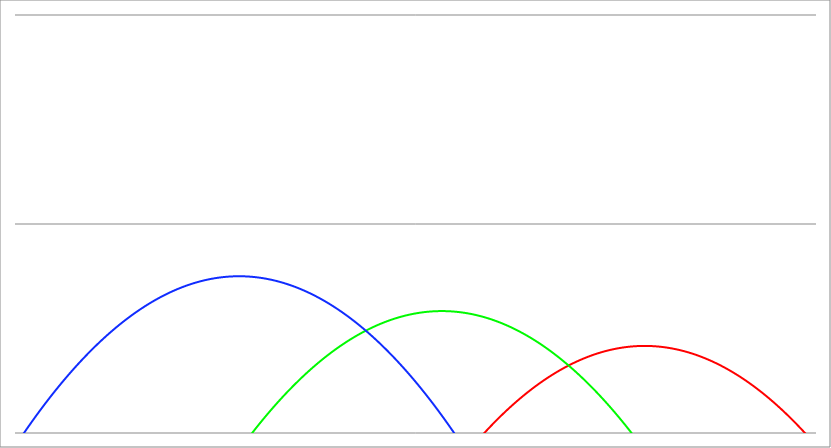
| Category | Series 1 | Series 0 | Series 2 |
|---|---|---|---|
| -4.2 | -41.94 | -20.14 | -6.34 |
| -4.19605 | -41.891 | -20.107 | -6.323 |
| -4.192100000000001 | -41.842 | -20.074 | -6.305 |
| -4.188150000000001 | -41.793 | -20.041 | -6.288 |
| -4.184200000000001 | -41.744 | -20.008 | -6.271 |
| -4.180250000000002 | -41.695 | -19.974 | -6.253 |
| -4.176300000000002 | -41.647 | -19.941 | -6.236 |
| -4.172350000000002 | -41.598 | -19.909 | -6.219 |
| -4.168400000000003 | -41.549 | -19.876 | -6.202 |
| -4.164450000000003 | -41.5 | -19.843 | -6.185 |
| -4.160500000000003 | -41.452 | -19.81 | -6.168 |
| -4.156550000000004 | -41.403 | -19.777 | -6.151 |
| -4.152600000000004 | -41.354 | -19.744 | -6.134 |
| -4.148650000000004 | -41.306 | -19.711 | -6.117 |
| -4.144700000000005 | -41.257 | -19.679 | -6.1 |
| -4.140750000000005 | -41.209 | -19.646 | -6.083 |
| -4.136800000000005 | -41.16 | -19.613 | -6.066 |
| -4.132850000000006 | -41.112 | -19.58 | -6.049 |
| -4.128900000000006 | -41.063 | -19.548 | -6.032 |
| -4.124950000000006 | -41.015 | -19.515 | -6.015 |
| -4.121000000000007 | -40.967 | -19.483 | -5.999 |
| -4.117050000000007 | -40.918 | -19.45 | -5.982 |
| -4.113100000000007 | -40.87 | -19.418 | -5.965 |
| -4.109150000000008 | -40.822 | -19.385 | -5.949 |
| -4.105200000000008 | -40.773 | -19.353 | -5.932 |
| -4.101250000000008 | -40.725 | -19.32 | -5.915 |
| -4.097300000000009 | -40.677 | -19.288 | -5.899 |
| -4.093350000000009 | -40.629 | -19.256 | -5.882 |
| -4.08940000000001 | -40.581 | -19.223 | -5.866 |
| -4.08545000000001 | -40.533 | -19.191 | -5.849 |
| -4.08150000000001 | -40.485 | -19.159 | -5.833 |
| -4.07755000000001 | -40.437 | -19.126 | -5.816 |
| -4.07360000000001 | -40.389 | -19.094 | -5.8 |
| -4.069650000000011 | -40.341 | -19.062 | -5.783 |
| -4.065700000000011 | -40.293 | -19.03 | -5.767 |
| -4.061750000000012 | -40.245 | -18.998 | -5.751 |
| -4.057800000000012 | -40.197 | -18.966 | -5.735 |
| -4.053850000000012 | -40.149 | -18.934 | -5.718 |
| -4.049900000000012 | -40.101 | -18.902 | -5.702 |
| -4.045950000000013 | -40.054 | -18.87 | -5.686 |
| -4.042000000000013 | -40.006 | -18.838 | -5.67 |
| -4.038050000000013 | -39.958 | -18.806 | -5.654 |
| -4.034100000000014 | -39.91 | -18.774 | -5.638 |
| -4.030150000000014 | -39.863 | -18.742 | -5.622 |
| -4.026200000000014 | -39.815 | -18.71 | -5.605 |
| -4.022250000000015 | -39.767 | -18.678 | -5.589 |
| -4.018300000000015 | -39.72 | -18.647 | -5.574 |
| -4.014350000000015 | -39.672 | -18.615 | -5.558 |
| -4.010400000000016 | -39.625 | -18.583 | -5.542 |
| -4.006450000000016 | -39.577 | -18.552 | -5.526 |
| -4.002500000000016 | -39.53 | -18.52 | -5.51 |
| -3.998550000000016 | -39.483 | -18.488 | -5.494 |
| -3.994600000000016 | -39.435 | -18.457 | -5.478 |
| -3.990650000000016 | -39.388 | -18.425 | -5.463 |
| -3.986700000000016 | -39.341 | -18.394 | -5.447 |
| -3.982750000000016 | -39.293 | -18.362 | -5.431 |
| -3.978800000000016 | -39.246 | -18.331 | -5.416 |
| -3.974850000000016 | -39.199 | -18.299 | -5.4 |
| -3.970900000000015 | -39.152 | -18.268 | -5.384 |
| -3.966950000000015 | -39.104 | -18.237 | -5.369 |
| -3.963000000000015 | -39.057 | -18.205 | -5.353 |
| -3.959050000000015 | -39.01 | -18.174 | -5.338 |
| -3.955100000000015 | -38.963 | -18.143 | -5.322 |
| -3.951150000000015 | -38.916 | -18.112 | -5.307 |
| -3.947200000000015 | -38.869 | -18.08 | -5.292 |
| -3.943250000000015 | -38.822 | -18.049 | -5.276 |
| -3.939300000000014 | -38.775 | -18.018 | -5.261 |
| -3.935350000000014 | -38.728 | -17.987 | -5.246 |
| -3.931400000000014 | -38.682 | -17.956 | -5.23 |
| -3.927450000000014 | -38.635 | -17.925 | -5.215 |
| -3.923500000000014 | -38.588 | -17.894 | -5.2 |
| -3.919550000000014 | -38.541 | -17.863 | -5.185 |
| -3.915600000000014 | -38.494 | -17.832 | -5.17 |
| -3.911650000000014 | -38.448 | -17.801 | -5.154 |
| -3.907700000000013 | -38.401 | -17.77 | -5.139 |
| -3.903750000000013 | -38.354 | -17.739 | -5.124 |
| -3.899800000000013 | -38.308 | -17.708 | -5.109 |
| -3.895850000000013 | -38.261 | -17.678 | -5.094 |
| -3.891900000000013 | -38.214 | -17.647 | -5.079 |
| -3.887950000000013 | -38.168 | -17.616 | -5.064 |
| -3.884000000000013 | -38.121 | -17.585 | -5.049 |
| -3.880050000000013 | -38.075 | -17.555 | -5.035 |
| -3.876100000000012 | -38.029 | -17.524 | -5.02 |
| -3.872150000000012 | -37.982 | -17.494 | -5.005 |
| -3.868200000000012 | -37.936 | -17.463 | -4.99 |
| -3.864250000000012 | -37.889 | -17.432 | -4.975 |
| -3.860300000000012 | -37.843 | -17.402 | -4.961 |
| -3.856350000000012 | -37.797 | -17.371 | -4.946 |
| -3.852400000000012 | -37.751 | -17.341 | -4.931 |
| -3.848450000000012 | -37.704 | -17.311 | -4.917 |
| -3.844500000000012 | -37.658 | -17.28 | -4.902 |
| -3.840550000000011 | -37.612 | -17.25 | -4.888 |
| -3.836600000000011 | -37.566 | -17.219 | -4.873 |
| -3.832650000000011 | -37.52 | -17.189 | -4.859 |
| -3.828700000000011 | -37.474 | -17.159 | -4.844 |
| -3.824750000000011 | -37.428 | -17.129 | -4.83 |
| -3.820800000000011 | -37.382 | -17.099 | -4.815 |
| -3.816850000000011 | -37.336 | -17.068 | -4.801 |
| -3.812900000000011 | -37.29 | -17.038 | -4.787 |
| -3.80895000000001 | -37.244 | -17.008 | -4.772 |
| -3.80500000000001 | -37.198 | -16.978 | -4.758 |
| -3.80105000000001 | -37.152 | -16.948 | -4.744 |
| -3.79710000000001 | -37.106 | -16.918 | -4.73 |
| -3.79315000000001 | -37.061 | -16.888 | -4.715 |
| -3.78920000000001 | -37.015 | -16.858 | -4.701 |
| -3.78525000000001 | -36.969 | -16.828 | -4.687 |
| -3.78130000000001 | -36.923 | -16.798 | -4.673 |
| -3.777350000000009 | -36.878 | -16.768 | -4.659 |
| -3.773400000000009 | -36.832 | -16.739 | -4.645 |
| -3.769450000000009 | -36.787 | -16.709 | -4.631 |
| -3.76550000000001 | -36.741 | -16.679 | -4.617 |
| -3.761550000000009 | -36.695 | -16.649 | -4.603 |
| -3.757600000000009 | -36.65 | -16.62 | -4.589 |
| -3.753650000000009 | -36.604 | -16.59 | -4.575 |
| -3.749700000000009 | -36.559 | -16.56 | -4.561 |
| -3.745750000000008 | -36.514 | -16.531 | -4.548 |
| -3.741800000000008 | -36.468 | -16.501 | -4.534 |
| -3.737850000000008 | -36.423 | -16.472 | -4.52 |
| -3.733900000000008 | -36.378 | -16.442 | -4.506 |
| -3.729950000000008 | -36.332 | -16.413 | -4.493 |
| -3.726000000000008 | -36.287 | -16.383 | -4.479 |
| -3.722050000000008 | -36.242 | -16.354 | -4.465 |
| -3.718100000000008 | -36.197 | -16.324 | -4.452 |
| -3.714150000000008 | -36.152 | -16.295 | -4.438 |
| -3.710200000000007 | -36.106 | -16.266 | -4.425 |
| -3.706250000000007 | -36.061 | -16.236 | -4.411 |
| -3.702300000000007 | -36.016 | -16.207 | -4.398 |
| -3.698350000000007 | -35.971 | -16.178 | -4.384 |
| -3.694400000000007 | -35.926 | -16.149 | -4.371 |
| -3.690450000000007 | -35.881 | -16.119 | -4.358 |
| -3.686500000000007 | -35.836 | -16.09 | -4.344 |
| -3.682550000000007 | -35.791 | -16.061 | -4.331 |
| -3.678600000000006 | -35.746 | -16.032 | -4.318 |
| -3.674650000000006 | -35.702 | -16.003 | -4.304 |
| -3.670700000000006 | -35.657 | -15.974 | -4.291 |
| -3.666750000000006 | -35.612 | -15.945 | -4.278 |
| -3.662800000000006 | -35.567 | -15.916 | -4.265 |
| -3.658850000000006 | -35.523 | -15.887 | -4.252 |
| -3.654900000000006 | -35.478 | -15.858 | -4.239 |
| -3.650950000000006 | -35.433 | -15.829 | -4.226 |
| -3.647000000000005 | -35.389 | -15.801 | -4.213 |
| -3.643050000000005 | -35.344 | -15.772 | -4.2 |
| -3.639100000000005 | -35.299 | -15.743 | -4.187 |
| -3.635150000000005 | -35.255 | -15.714 | -4.174 |
| -3.631200000000005 | -35.21 | -15.686 | -4.161 |
| -3.627250000000005 | -35.166 | -15.657 | -4.148 |
| -3.623300000000005 | -35.122 | -15.628 | -4.135 |
| -3.619350000000005 | -35.077 | -15.6 | -4.122 |
| -3.615400000000005 | -35.033 | -15.571 | -4.11 |
| -3.611450000000004 | -34.988 | -15.543 | -4.097 |
| -3.607500000000004 | -34.944 | -15.514 | -4.084 |
| -3.603550000000004 | -34.9 | -15.486 | -4.071 |
| -3.599600000000004 | -34.856 | -15.457 | -4.059 |
| -3.595650000000004 | -34.811 | -15.429 | -4.046 |
| -3.591700000000004 | -34.767 | -15.4 | -4.034 |
| -3.587750000000004 | -34.723 | -15.372 | -4.021 |
| -3.583800000000004 | -34.679 | -15.344 | -4.008 |
| -3.579850000000004 | -34.635 | -15.315 | -3.996 |
| -3.575900000000003 | -34.591 | -15.287 | -3.983 |
| -3.571950000000003 | -34.547 | -15.259 | -3.971 |
| -3.568000000000003 | -34.503 | -15.231 | -3.959 |
| -3.564050000000003 | -34.459 | -15.202 | -3.946 |
| -3.560100000000003 | -34.415 | -15.174 | -3.934 |
| -3.556150000000003 | -34.371 | -15.146 | -3.922 |
| -3.552200000000003 | -34.327 | -15.118 | -3.909 |
| -3.548250000000003 | -34.283 | -15.09 | -3.897 |
| -3.544300000000002 | -34.239 | -15.062 | -3.885 |
| -3.540350000000002 | -34.195 | -15.034 | -3.873 |
| -3.536400000000002 | -34.152 | -15.006 | -3.861 |
| -3.532450000000002 | -34.108 | -14.978 | -3.848 |
| -3.528500000000002 | -34.064 | -14.95 | -3.836 |
| -3.524550000000002 | -34.021 | -14.922 | -3.824 |
| -3.520600000000002 | -33.977 | -14.895 | -3.812 |
| -3.516650000000002 | -33.933 | -14.867 | -3.8 |
| -3.512700000000001 | -33.89 | -14.839 | -3.788 |
| -3.508750000000001 | -33.846 | -14.811 | -3.776 |
| -3.504800000000001 | -33.803 | -14.784 | -3.764 |
| -3.500850000000001 | -33.759 | -14.756 | -3.753 |
| -3.496900000000001 | -33.716 | -14.728 | -3.741 |
| -3.492950000000001 | -33.672 | -14.701 | -3.729 |
| -3.489000000000001 | -33.629 | -14.673 | -3.717 |
| -3.485050000000001 | -33.586 | -14.646 | -3.705 |
| -3.4811 | -33.542 | -14.618 | -3.694 |
| -3.47715 | -33.499 | -14.591 | -3.682 |
| -3.4732 | -33.456 | -14.563 | -3.67 |
| -3.46925 | -33.413 | -14.536 | -3.659 |
| -3.4653 | -33.37 | -14.508 | -3.647 |
| -3.46135 | -33.326 | -14.481 | -3.636 |
| -3.4574 | -33.283 | -14.454 | -3.624 |
| -3.45345 | -33.24 | -14.426 | -3.613 |
| -3.4495 | -33.197 | -14.399 | -3.601 |
| -3.445549999999999 | -33.154 | -14.372 | -3.59 |
| -3.441599999999999 | -33.111 | -14.345 | -3.578 |
| -3.437649999999999 | -33.068 | -14.317 | -3.567 |
| -3.433699999999999 | -33.025 | -14.29 | -3.555 |
| -3.429749999999999 | -32.982 | -14.263 | -3.544 |
| -3.425799999999999 | -32.939 | -14.236 | -3.533 |
| -3.421849999999999 | -32.896 | -14.209 | -3.522 |
| -3.417899999999999 | -32.854 | -14.182 | -3.51 |
| -3.413949999999998 | -32.811 | -14.155 | -3.499 |
| -3.409999999999998 | -32.768 | -14.128 | -3.488 |
| -3.406049999999998 | -32.725 | -14.101 | -3.477 |
| -3.402099999999998 | -32.683 | -14.074 | -3.466 |
| -3.398149999999998 | -32.64 | -14.047 | -3.455 |
| -3.394199999999998 | -32.597 | -14.021 | -3.444 |
| -3.390249999999998 | -32.555 | -13.994 | -3.433 |
| -3.386299999999998 | -32.512 | -13.967 | -3.422 |
| -3.382349999999997 | -32.47 | -13.94 | -3.411 |
| -3.378399999999997 | -32.427 | -13.914 | -3.4 |
| -3.374449999999997 | -32.385 | -13.887 | -3.389 |
| -3.370499999999997 | -32.342 | -13.86 | -3.378 |
| -3.366549999999997 | -32.3 | -13.834 | -3.367 |
| -3.362599999999997 | -32.257 | -13.807 | -3.357 |
| -3.358649999999997 | -32.215 | -13.781 | -3.346 |
| -3.354699999999997 | -32.173 | -13.754 | -3.335 |
| -3.350749999999997 | -32.131 | -13.728 | -3.325 |
| -3.346799999999996 | -32.088 | -13.701 | -3.314 |
| -3.342849999999996 | -32.046 | -13.675 | -3.303 |
| -3.338899999999996 | -32.004 | -13.648 | -3.293 |
| -3.334949999999996 | -31.962 | -13.622 | -3.282 |
| -3.330999999999996 | -31.92 | -13.596 | -3.272 |
| -3.327049999999996 | -31.877 | -13.569 | -3.261 |
| -3.323099999999996 | -31.835 | -13.543 | -3.251 |
| -3.319149999999996 | -31.793 | -13.517 | -3.24 |
| -3.315199999999995 | -31.751 | -13.491 | -3.23 |
| -3.311249999999995 | -31.709 | -13.464 | -3.219 |
| -3.307299999999995 | -31.667 | -13.438 | -3.209 |
| -3.303349999999995 | -31.626 | -13.412 | -3.199 |
| -3.299399999999995 | -31.584 | -13.386 | -3.188 |
| -3.295449999999995 | -31.542 | -13.36 | -3.178 |
| -3.291499999999995 | -31.5 | -13.334 | -3.168 |
| -3.287549999999995 | -31.458 | -13.308 | -3.158 |
| -3.283599999999994 | -31.416 | -13.282 | -3.148 |
| -3.279649999999994 | -31.375 | -13.256 | -3.138 |
| -3.275699999999994 | -31.333 | -13.23 | -3.127 |
| -3.271749999999994 | -31.291 | -13.204 | -3.117 |
| -3.267799999999994 | -31.25 | -13.179 | -3.107 |
| -3.263849999999994 | -31.208 | -13.153 | -3.097 |
| -3.259899999999994 | -31.167 | -13.127 | -3.087 |
| -3.255949999999994 | -31.125 | -13.101 | -3.077 |
| -3.251999999999994 | -31.084 | -13.076 | -3.068 |
| -3.248049999999993 | -31.042 | -13.05 | -3.058 |
| -3.244099999999993 | -31.001 | -13.024 | -3.048 |
| -3.240149999999993 | -30.959 | -12.999 | -3.038 |
| -3.236199999999993 | -30.918 | -12.973 | -3.028 |
| -3.232249999999993 | -30.876 | -12.947 | -3.018 |
| -3.228299999999993 | -30.835 | -12.922 | -3.009 |
| -3.224349999999993 | -30.794 | -12.896 | -2.999 |
| -3.220399999999992 | -30.753 | -12.871 | -2.989 |
| -3.216449999999992 | -30.711 | -12.846 | -2.98 |
| -3.212499999999992 | -30.67 | -12.82 | -2.97 |
| -3.208549999999992 | -30.629 | -12.795 | -2.961 |
| -3.204599999999992 | -30.588 | -12.769 | -2.951 |
| -3.200649999999992 | -30.547 | -12.744 | -2.942 |
| -3.196699999999992 | -30.506 | -12.719 | -2.932 |
| -3.192749999999992 | -30.465 | -12.694 | -2.923 |
| -3.188799999999992 | -30.424 | -12.668 | -2.913 |
| -3.184849999999991 | -30.383 | -12.643 | -2.904 |
| -3.180899999999991 | -30.342 | -12.618 | -2.895 |
| -3.176949999999991 | -30.301 | -12.593 | -2.885 |
| -3.172999999999991 | -30.26 | -12.568 | -2.876 |
| -3.169049999999991 | -30.219 | -12.543 | -2.867 |
| -3.165099999999991 | -30.178 | -12.518 | -2.857 |
| -3.161149999999991 | -30.137 | -12.493 | -2.848 |
| -3.157199999999991 | -30.097 | -12.468 | -2.839 |
| -3.153249999999991 | -30.056 | -12.443 | -2.83 |
| -3.14929999999999 | -30.015 | -12.418 | -2.821 |
| -3.14534999999999 | -29.975 | -12.393 | -2.812 |
| -3.14139999999999 | -29.934 | -12.368 | -2.803 |
| -3.13744999999999 | -29.893 | -12.344 | -2.794 |
| -3.13349999999999 | -29.853 | -12.319 | -2.785 |
| -3.12954999999999 | -29.812 | -12.294 | -2.776 |
| -3.12559999999999 | -29.772 | -12.269 | -2.767 |
| -3.12164999999999 | -29.731 | -12.245 | -2.758 |
| -3.117699999999989 | -29.691 | -12.22 | -2.749 |
| -3.113749999999989 | -29.65 | -12.195 | -2.74 |
| -3.109799999999989 | -29.61 | -12.171 | -2.732 |
| -3.105849999999989 | -29.57 | -12.146 | -2.723 |
| -3.101899999999989 | -29.529 | -12.122 | -2.714 |
| -3.097949999999989 | -29.489 | -12.097 | -2.705 |
| -3.093999999999989 | -29.449 | -12.073 | -2.697 |
| -3.090049999999989 | -29.409 | -12.048 | -2.688 |
| -3.086099999999989 | -29.368 | -12.024 | -2.68 |
| -3.082149999999988 | -29.328 | -12 | -2.671 |
| -3.078199999999988 | -29.288 | -11.975 | -2.663 |
| -3.074249999999988 | -29.248 | -11.951 | -2.654 |
| -3.070299999999988 | -29.208 | -11.927 | -2.646 |
| -3.066349999999988 | -29.168 | -11.903 | -2.637 |
| -3.062399999999988 | -29.128 | -11.878 | -2.629 |
| -3.058449999999988 | -29.088 | -11.854 | -2.62 |
| -3.054499999999988 | -29.048 | -11.83 | -2.612 |
| -3.050549999999987 | -29.008 | -11.806 | -2.604 |
| -3.046599999999987 | -28.968 | -11.782 | -2.595 |
| -3.042649999999987 | -28.928 | -11.758 | -2.587 |
| -3.038699999999987 | -28.888 | -11.734 | -2.579 |
| -3.034749999999987 | -28.849 | -11.71 | -2.571 |
| -3.030799999999987 | -28.809 | -11.686 | -2.563 |
| -3.026849999999987 | -28.769 | -11.662 | -2.554 |
| -3.022899999999987 | -28.73 | -11.638 | -2.546 |
| -3.018949999999986 | -28.69 | -11.614 | -2.538 |
| -3.014999999999986 | -28.65 | -11.59 | -2.53 |
| -3.011049999999986 | -28.611 | -11.566 | -2.522 |
| -3.007099999999986 | -28.571 | -11.543 | -2.514 |
| -3.003149999999986 | -28.532 | -11.519 | -2.506 |
| -2.999199999999986 | -28.492 | -11.495 | -2.498 |
| -2.995249999999986 | -28.453 | -11.472 | -2.491 |
| -2.991299999999986 | -28.413 | -11.448 | -2.483 |
| -2.987349999999985 | -28.374 | -11.424 | -2.475 |
| -2.983399999999985 | -28.334 | -11.401 | -2.467 |
| -2.979449999999985 | -28.295 | -11.377 | -2.459 |
| -2.975499999999985 | -28.256 | -11.354 | -2.452 |
| -2.971549999999985 | -28.216 | -11.33 | -2.444 |
| -2.967599999999985 | -28.177 | -11.307 | -2.436 |
| -2.963649999999985 | -28.138 | -11.283 | -2.429 |
| -2.959699999999985 | -28.099 | -11.26 | -2.421 |
| -2.955749999999985 | -28.059 | -11.236 | -2.413 |
| -2.951799999999984 | -28.02 | -11.213 | -2.406 |
| -2.947849999999984 | -27.981 | -11.19 | -2.398 |
| -2.943899999999984 | -27.942 | -11.167 | -2.391 |
| -2.939949999999984 | -27.903 | -11.143 | -2.384 |
| -2.935999999999984 | -27.864 | -11.12 | -2.376 |
| -2.932049999999984 | -27.825 | -11.097 | -2.369 |
| -2.928099999999984 | -27.786 | -11.074 | -2.361 |
| -2.924149999999984 | -27.747 | -11.051 | -2.354 |
| -2.920199999999983 | -27.708 | -11.028 | -2.347 |
| -2.916249999999983 | -27.67 | -11.005 | -2.34 |
| -2.912299999999983 | -27.631 | -10.981 | -2.332 |
| -2.908349999999983 | -27.592 | -10.958 | -2.325 |
| -2.904399999999983 | -27.553 | -10.936 | -2.318 |
| -2.900449999999983 | -27.514 | -10.913 | -2.311 |
| -2.896499999999983 | -27.476 | -10.89 | -2.304 |
| -2.892549999999983 | -27.437 | -10.867 | -2.297 |
| -2.888599999999982 | -27.398 | -10.844 | -2.29 |
| -2.884649999999982 | -27.36 | -10.821 | -2.283 |
| -2.880699999999982 | -27.321 | -10.798 | -2.276 |
| -2.876749999999982 | -27.283 | -10.776 | -2.269 |
| -2.872799999999982 | -27.244 | -10.753 | -2.262 |
| -2.868849999999982 | -27.206 | -10.73 | -2.255 |
| -2.864899999999982 | -27.167 | -10.708 | -2.248 |
| -2.860949999999982 | -27.129 | -10.685 | -2.241 |
| -2.856999999999981 | -27.09 | -10.662 | -2.234 |
| -2.853049999999981 | -27.052 | -10.64 | -2.228 |
| -2.849099999999981 | -27.014 | -10.617 | -2.221 |
| -2.845149999999981 | -26.975 | -10.595 | -2.214 |
| -2.841199999999981 | -26.937 | -10.572 | -2.208 |
| -2.837249999999981 | -26.899 | -10.55 | -2.201 |
| -2.833299999999981 | -26.861 | -10.528 | -2.194 |
| -2.829349999999981 | -26.823 | -10.505 | -2.188 |
| -2.825399999999981 | -26.784 | -10.483 | -2.181 |
| -2.82144999999998 | -26.746 | -10.461 | -2.175 |
| -2.81749999999998 | -26.708 | -10.438 | -2.168 |
| -2.81354999999998 | -26.67 | -10.416 | -2.162 |
| -2.80959999999998 | -26.632 | -10.394 | -2.155 |
| -2.80564999999998 | -26.594 | -10.372 | -2.149 |
| -2.80169999999998 | -26.556 | -10.35 | -2.143 |
| -2.79774999999998 | -26.518 | -10.327 | -2.136 |
| -2.79379999999998 | -26.481 | -10.305 | -2.13 |
| -2.789849999999979 | -26.443 | -10.283 | -2.124 |
| -2.785899999999979 | -26.405 | -10.261 | -2.118 |
| -2.781949999999979 | -26.367 | -10.239 | -2.111 |
| -2.77799999999998 | -26.329 | -10.217 | -2.105 |
| -2.774049999999979 | -26.292 | -10.195 | -2.099 |
| -2.770099999999979 | -26.254 | -10.173 | -2.093 |
| -2.766149999999979 | -26.216 | -10.152 | -2.087 |
| -2.762199999999979 | -26.179 | -10.13 | -2.081 |
| -2.758249999999978 | -26.141 | -10.108 | -2.075 |
| -2.754299999999978 | -26.103 | -10.086 | -2.069 |
| -2.750349999999978 | -26.066 | -10.064 | -2.063 |
| -2.746399999999978 | -26.028 | -10.043 | -2.057 |
| -2.742449999999978 | -25.991 | -10.021 | -2.051 |
| -2.738499999999978 | -25.953 | -9.999 | -2.045 |
| -2.734549999999978 | -25.916 | -9.978 | -2.04 |
| -2.730599999999978 | -25.879 | -9.956 | -2.034 |
| -2.726649999999978 | -25.841 | -9.935 | -2.028 |
| -2.722699999999977 | -25.804 | -9.913 | -2.022 |
| -2.718749999999977 | -25.767 | -9.892 | -2.017 |
| -2.714799999999977 | -25.729 | -9.87 | -2.011 |
| -2.710849999999977 | -25.692 | -9.849 | -2.005 |
| -2.706899999999977 | -25.655 | -9.827 | -2 |
| -2.702949999999977 | -25.618 | -9.806 | -1.994 |
| -2.698999999999977 | -25.581 | -9.785 | -1.989 |
| -2.695049999999977 | -25.543 | -9.763 | -1.983 |
| -2.691099999999976 | -25.506 | -9.742 | -1.978 |
| -2.687149999999976 | -25.469 | -9.721 | -1.972 |
| -2.683199999999976 | -25.432 | -9.7 | -1.967 |
| -2.679249999999976 | -25.395 | -9.678 | -1.961 |
| -2.675299999999976 | -25.358 | -9.657 | -1.956 |
| -2.671349999999976 | -25.322 | -9.636 | -1.951 |
| -2.667399999999976 | -25.285 | -9.615 | -1.945 |
| -2.663449999999976 | -25.248 | -9.594 | -1.94 |
| -2.659499999999975 | -25.211 | -9.573 | -1.935 |
| -2.655549999999975 | -25.174 | -9.552 | -1.93 |
| -2.651599999999975 | -25.137 | -9.531 | -1.925 |
| -2.647649999999975 | -25.101 | -9.51 | -1.919 |
| -2.643699999999975 | -25.064 | -9.489 | -1.914 |
| -2.639749999999975 | -25.027 | -9.468 | -1.909 |
| -2.635799999999975 | -24.991 | -9.447 | -1.904 |
| -2.631849999999975 | -24.954 | -9.427 | -1.899 |
| -2.627899999999974 | -24.917 | -9.406 | -1.894 |
| -2.623949999999974 | -24.881 | -9.385 | -1.889 |
| -2.619999999999974 | -24.844 | -9.364 | -1.884 |
| -2.616049999999974 | -24.808 | -9.344 | -1.88 |
| -2.612099999999974 | -24.771 | -9.323 | -1.875 |
| -2.608149999999974 | -24.735 | -9.302 | -1.87 |
| -2.604199999999974 | -24.699 | -9.282 | -1.865 |
| -2.600249999999974 | -24.662 | -9.261 | -1.86 |
| -2.596299999999974 | -24.626 | -9.241 | -1.856 |
| -2.592349999999973 | -24.59 | -9.22 | -1.851 |
| -2.588399999999973 | -24.553 | -9.2 | -1.846 |
| -2.584449999999973 | -24.517 | -9.179 | -1.842 |
| -2.580499999999973 | -24.481 | -9.159 | -1.837 |
| -2.576549999999973 | -24.445 | -9.139 | -1.832 |
| -2.572599999999973 | -24.409 | -9.118 | -1.828 |
| -2.568649999999973 | -24.373 | -9.098 | -1.823 |
| -2.564699999999973 | -24.336 | -9.078 | -1.819 |
| -2.560749999999973 | -24.3 | -9.057 | -1.814 |
| -2.556799999999972 | -24.264 | -9.037 | -1.81 |
| -2.552849999999972 | -24.228 | -9.017 | -1.806 |
| -2.548899999999972 | -24.192 | -8.997 | -1.801 |
| -2.544949999999972 | -24.157 | -8.977 | -1.797 |
| -2.540999999999972 | -24.121 | -8.957 | -1.793 |
| -2.537049999999972 | -24.085 | -8.937 | -1.788 |
| -2.533099999999972 | -24.049 | -8.917 | -1.784 |
| -2.529149999999972 | -24.013 | -8.897 | -1.78 |
| -2.525199999999971 | -23.977 | -8.877 | -1.776 |
| -2.521249999999971 | -23.942 | -8.857 | -1.772 |
| -2.517299999999971 | -23.906 | -8.837 | -1.768 |
| -2.513349999999971 | -23.87 | -8.817 | -1.764 |
| -2.509399999999971 | -23.835 | -8.797 | -1.759 |
| -2.505449999999971 | -23.799 | -8.777 | -1.755 |
| -2.501499999999971 | -23.764 | -8.758 | -1.752 |
| -2.497549999999971 | -23.728 | -8.738 | -1.748 |
| -2.49359999999997 | -23.692 | -8.718 | -1.744 |
| -2.48964999999997 | -23.657 | -8.698 | -1.74 |
| -2.48569999999997 | -23.622 | -8.679 | -1.736 |
| -2.48174999999997 | -23.586 | -8.659 | -1.732 |
| -2.47779999999997 | -23.551 | -8.639 | -1.728 |
| -2.47384999999997 | -23.515 | -8.62 | -1.725 |
| -2.46989999999997 | -23.48 | -8.6 | -1.721 |
| -2.46594999999997 | -23.445 | -8.581 | -1.717 |
| -2.46199999999997 | -23.409 | -8.561 | -1.713 |
| -2.458049999999969 | -23.374 | -8.542 | -1.71 |
| -2.454099999999969 | -23.339 | -8.523 | -1.706 |
| -2.450149999999969 | -23.304 | -8.503 | -1.703 |
| -2.446199999999969 | -23.269 | -8.484 | -1.699 |
| -2.442249999999969 | -23.234 | -8.465 | -1.696 |
| -2.438299999999969 | -23.199 | -8.445 | -1.692 |
| -2.434349999999969 | -23.163 | -8.426 | -1.689 |
| -2.430399999999969 | -23.128 | -8.407 | -1.685 |
| -2.426449999999968 | -23.093 | -8.388 | -1.682 |
| -2.422499999999968 | -23.059 | -8.369 | -1.679 |
| -2.418549999999968 | -23.024 | -8.349 | -1.675 |
| -2.414599999999968 | -22.989 | -8.33 | -1.672 |
| -2.410649999999968 | -22.954 | -8.311 | -1.669 |
| -2.406699999999968 | -22.919 | -8.292 | -1.665 |
| -2.402749999999968 | -22.884 | -8.273 | -1.662 |
| -2.398799999999968 | -22.849 | -8.254 | -1.659 |
| -2.394849999999967 | -22.815 | -8.235 | -1.656 |
| -2.390899999999967 | -22.78 | -8.216 | -1.653 |
| -2.386949999999967 | -22.745 | -8.198 | -1.65 |
| -2.382999999999967 | -22.711 | -8.179 | -1.647 |
| -2.379049999999967 | -22.676 | -8.16 | -1.644 |
| -2.375099999999967 | -22.642 | -8.141 | -1.641 |
| -2.371149999999967 | -22.607 | -8.122 | -1.638 |
| -2.367199999999967 | -22.572 | -8.104 | -1.635 |
| -2.363249999999966 | -22.538 | -8.085 | -1.632 |
| -2.359299999999966 | -22.503 | -8.066 | -1.629 |
| -2.355349999999966 | -22.469 | -8.048 | -1.626 |
| -2.351399999999966 | -22.435 | -8.029 | -1.623 |
| -2.347449999999966 | -22.4 | -8.011 | -1.621 |
| -2.343499999999966 | -22.366 | -7.992 | -1.618 |
| -2.339549999999966 | -22.332 | -7.973 | -1.615 |
| -2.335599999999966 | -22.297 | -7.955 | -1.613 |
| -2.331649999999966 | -22.263 | -7.937 | -1.61 |
| -2.327699999999965 | -22.229 | -7.918 | -1.607 |
| -2.323749999999965 | -22.195 | -7.9 | -1.605 |
| -2.319799999999965 | -22.161 | -7.881 | -1.602 |
| -2.315849999999965 | -22.127 | -7.863 | -1.6 |
| -2.311899999999965 | -22.092 | -7.845 | -1.597 |
| -2.307949999999965 | -22.058 | -7.827 | -1.595 |
| -2.303999999999965 | -22.024 | -7.808 | -1.592 |
| -2.300049999999965 | -21.99 | -7.79 | -1.59 |
| -2.296099999999964 | -21.956 | -7.772 | -1.588 |
| -2.292149999999964 | -21.923 | -7.754 | -1.585 |
| -2.288199999999964 | -21.889 | -7.736 | -1.583 |
| -2.284249999999964 | -21.855 | -7.718 | -1.581 |
| -2.280299999999964 | -21.821 | -7.7 | -1.579 |
| -2.276349999999964 | -21.787 | -7.682 | -1.576 |
| -2.272399999999964 | -21.753 | -7.664 | -1.574 |
| -2.268449999999964 | -21.72 | -7.646 | -1.572 |
| -2.264499999999964 | -21.686 | -7.628 | -1.57 |
| -2.260549999999963 | -21.652 | -7.61 | -1.568 |
| -2.256599999999963 | -21.619 | -7.592 | -1.566 |
| -2.252649999999963 | -21.585 | -7.574 | -1.564 |
| -2.248699999999963 | -21.551 | -7.557 | -1.562 |
| -2.244749999999963 | -21.518 | -7.539 | -1.56 |
| -2.240799999999963 | -21.484 | -7.521 | -1.558 |
| -2.236849999999963 | -21.451 | -7.503 | -1.556 |
| -2.232899999999963 | -21.417 | -7.486 | -1.554 |
| -2.228949999999962 | -21.384 | -7.468 | -1.552 |
| -2.224999999999962 | -21.351 | -7.451 | -1.551 |
| -2.221049999999962 | -21.317 | -7.433 | -1.549 |
| -2.217099999999962 | -21.284 | -7.416 | -1.547 |
| -2.213149999999962 | -21.251 | -7.398 | -1.545 |
| -2.209199999999962 | -21.217 | -7.381 | -1.544 |
| -2.205249999999962 | -21.184 | -7.363 | -1.542 |
| -2.201299999999962 | -21.151 | -7.346 | -1.541 |
| -2.197349999999961 | -21.118 | -7.328 | -1.539 |
| -2.193399999999961 | -21.085 | -7.311 | -1.537 |
| -2.189449999999961 | -21.051 | -7.294 | -1.536 |
| -2.185499999999961 | -21.018 | -7.276 | -1.534 |
| -2.181549999999961 | -20.985 | -7.259 | -1.533 |
| -2.177599999999961 | -20.952 | -7.242 | -1.532 |
| -2.173649999999961 | -20.919 | -7.225 | -1.53 |
| -2.169699999999961 | -20.886 | -7.208 | -1.529 |
| -2.165749999999961 | -20.853 | -7.19 | -1.527 |
| -2.16179999999996 | -20.821 | -7.173 | -1.526 |
| -2.15784999999996 | -20.788 | -7.156 | -1.525 |
| -2.15389999999996 | -20.755 | -7.139 | -1.524 |
| -2.14994999999996 | -20.722 | -7.122 | -1.522 |
| -2.14599999999996 | -20.689 | -7.105 | -1.521 |
| -2.14204999999996 | -20.657 | -7.088 | -1.52 |
| -2.13809999999996 | -20.624 | -7.071 | -1.519 |
| -2.13414999999996 | -20.591 | -7.055 | -1.518 |
| -2.130199999999959 | -20.559 | -7.038 | -1.517 |
| -2.126249999999959 | -20.526 | -7.021 | -1.516 |
| -2.122299999999959 | -20.493 | -7.004 | -1.515 |
| -2.118349999999959 | -20.461 | -6.987 | -1.514 |
| -2.114399999999959 | -20.428 | -6.971 | -1.513 |
| -2.110449999999959 | -20.396 | -6.954 | -1.512 |
| -2.106499999999959 | -20.363 | -6.937 | -1.511 |
| -2.102549999999959 | -20.331 | -6.921 | -1.511 |
| -2.098599999999958 | -20.299 | -6.904 | -1.51 |
| -2.094649999999958 | -20.266 | -6.888 | -1.509 |
| -2.090699999999958 | -20.234 | -6.871 | -1.508 |
| -2.086749999999958 | -20.202 | -6.855 | -1.508 |
| -2.082799999999958 | -20.169 | -6.838 | -1.507 |
| -2.078849999999958 | -20.137 | -6.822 | -1.506 |
| -2.074899999999958 | -20.105 | -6.805 | -1.506 |
| -2.070949999999958 | -20.073 | -6.789 | -1.505 |
| -2.066999999999958 | -20.04 | -6.772 | -1.504 |
| -2.063049999999957 | -20.008 | -6.756 | -1.504 |
| -2.059099999999957 | -19.976 | -6.74 | -1.503 |
| -2.055149999999957 | -19.944 | -6.724 | -1.503 |
| -2.051199999999957 | -19.912 | -6.707 | -1.503 |
| -2.047249999999957 | -19.88 | -6.691 | -1.502 |
| -2.043299999999957 | -19.848 | -6.675 | -1.502 |
| -2.039349999999957 | -19.816 | -6.659 | -1.502 |
| -2.035399999999957 | -19.784 | -6.643 | -1.501 |
| -2.031449999999956 | -19.753 | -6.627 | -1.501 |
| -2.027499999999956 | -19.721 | -6.611 | -1.501 |
| -2.023549999999956 | -19.689 | -6.595 | -1.501 |
| -2.019599999999956 | -19.657 | -6.579 | -1.5 |
| -2.015649999999956 | -19.625 | -6.563 | -1.5 |
| -2.011699999999956 | -19.594 | -6.547 | -1.5 |
| -2.007749999999956 | -19.562 | -6.531 | -1.5 |
| -2.003799999999956 | -19.53 | -6.515 | -1.5 |
| -1.999849999999956 | -19.499 | -6.499 | -1.5 |
| -1.995899999999956 | -19.467 | -6.484 | -1.5 |
| -1.991949999999956 | -19.436 | -6.468 | -1.5 |
| -1.987999999999956 | -19.404 | -6.452 | -1.5 |
| -1.984049999999956 | -19.373 | -6.436 | -1.5 |
| -1.980099999999956 | -19.341 | -6.421 | -1.5 |
| -1.976149999999956 | -19.31 | -6.405 | -1.501 |
| -1.972199999999956 | -19.278 | -6.39 | -1.501 |
| -1.968249999999956 | -19.247 | -6.374 | -1.501 |
| -1.964299999999957 | -19.216 | -6.358 | -1.501 |
| -1.960349999999957 | -19.184 | -6.343 | -1.502 |
| -1.956399999999957 | -19.153 | -6.328 | -1.502 |
| -1.952449999999957 | -19.122 | -6.312 | -1.502 |
| -1.948499999999957 | -19.091 | -6.297 | -1.503 |
| -1.944549999999957 | -19.059 | -6.281 | -1.503 |
| -1.940599999999957 | -19.028 | -6.266 | -1.504 |
| -1.936649999999957 | -18.997 | -6.251 | -1.504 |
| -1.932699999999957 | -18.966 | -6.235 | -1.505 |
| -1.928749999999958 | -18.935 | -6.22 | -1.505 |
| -1.924799999999958 | -18.904 | -6.205 | -1.506 |
| -1.920849999999958 | -18.873 | -6.19 | -1.506 |
| -1.916899999999958 | -18.842 | -6.175 | -1.507 |
| -1.912949999999958 | -18.811 | -6.159 | -1.508 |
| -1.908999999999958 | -18.78 | -6.144 | -1.508 |
| -1.905049999999958 | -18.749 | -6.129 | -1.509 |
| -1.901099999999958 | -18.719 | -6.114 | -1.51 |
| -1.897149999999958 | -18.688 | -6.099 | -1.511 |
| -1.893199999999958 | -18.657 | -6.084 | -1.511 |
| -1.889249999999959 | -18.626 | -6.069 | -1.512 |
| -1.885299999999959 | -18.596 | -6.054 | -1.513 |
| -1.881349999999959 | -18.565 | -6.039 | -1.514 |
| -1.877399999999959 | -18.534 | -6.025 | -1.515 |
| -1.873449999999959 | -18.504 | -6.01 | -1.516 |
| -1.869499999999959 | -18.473 | -5.995 | -1.517 |
| -1.865549999999959 | -18.442 | -5.98 | -1.518 |
| -1.861599999999959 | -18.412 | -5.966 | -1.519 |
| -1.857649999999959 | -18.381 | -5.951 | -1.52 |
| -1.853699999999959 | -18.351 | -5.936 | -1.521 |
| -1.84974999999996 | -18.321 | -5.922 | -1.523 |
| -1.84579999999996 | -18.29 | -5.907 | -1.524 |
| -1.84184999999996 | -18.26 | -5.892 | -1.525 |
| -1.83789999999996 | -18.229 | -5.878 | -1.526 |
| -1.83394999999996 | -18.199 | -5.863 | -1.528 |
| -1.82999999999996 | -18.169 | -5.849 | -1.529 |
| -1.82604999999996 | -18.139 | -5.834 | -1.53 |
| -1.82209999999996 | -18.108 | -5.82 | -1.532 |
| -1.81814999999996 | -18.078 | -5.806 | -1.533 |
| -1.81419999999996 | -18.048 | -5.791 | -1.535 |
| -1.810249999999961 | -18.018 | -5.777 | -1.536 |
| -1.806299999999961 | -17.988 | -5.763 | -1.538 |
| -1.802349999999961 | -17.958 | -5.748 | -1.539 |
| -1.798399999999961 | -17.928 | -5.734 | -1.541 |
| -1.794449999999961 | -17.898 | -5.72 | -1.542 |
| -1.790499999999961 | -17.868 | -5.706 | -1.544 |
| -1.786549999999961 | -17.838 | -5.692 | -1.546 |
| -1.782599999999961 | -17.808 | -5.678 | -1.547 |
| -1.778649999999961 | -17.778 | -5.664 | -1.549 |
| -1.774699999999961 | -17.748 | -5.65 | -1.551 |
| -1.770749999999962 | -17.719 | -5.636 | -1.553 |
| -1.766799999999962 | -17.689 | -5.622 | -1.554 |
| -1.762849999999962 | -17.659 | -5.608 | -1.556 |
| -1.758899999999962 | -17.629 | -5.594 | -1.558 |
| -1.754949999999962 | -17.6 | -5.58 | -1.56 |
| -1.750999999999962 | -17.57 | -5.566 | -1.562 |
| -1.747049999999962 | -17.54 | -5.552 | -1.564 |
| -1.743099999999962 | -17.511 | -5.538 | -1.566 |
| -1.739149999999962 | -17.481 | -5.525 | -1.568 |
| -1.735199999999962 | -17.452 | -5.511 | -1.57 |
| -1.731249999999963 | -17.422 | -5.497 | -1.572 |
| -1.727299999999963 | -17.393 | -5.484 | -1.574 |
| -1.723349999999963 | -17.363 | -5.47 | -1.577 |
| -1.719399999999963 | -17.334 | -5.456 | -1.579 |
| -1.715449999999963 | -17.305 | -5.443 | -1.581 |
| -1.711499999999963 | -17.275 | -5.429 | -1.583 |
| -1.707549999999963 | -17.246 | -5.416 | -1.586 |
| -1.703599999999963 | -17.217 | -5.402 | -1.588 |
| -1.699649999999963 | -17.187 | -5.389 | -1.59 |
| -1.695699999999963 | -17.158 | -5.375 | -1.593 |
| -1.691749999999964 | -17.129 | -5.362 | -1.595 |
| -1.687799999999964 | -17.1 | -5.349 | -1.597 |
| -1.683849999999964 | -17.071 | -5.335 | -1.6 |
| -1.679899999999964 | -17.042 | -5.322 | -1.602 |
| -1.675949999999964 | -17.013 | -5.309 | -1.605 |
| -1.671999999999964 | -16.984 | -5.296 | -1.608 |
| -1.668049999999964 | -16.955 | -5.282 | -1.61 |
| -1.664099999999964 | -16.926 | -5.269 | -1.613 |
| -1.660149999999964 | -16.897 | -5.256 | -1.615 |
| -1.656199999999964 | -16.868 | -5.243 | -1.618 |
| -1.652249999999965 | -16.839 | -5.23 | -1.621 |
| -1.648299999999965 | -16.81 | -5.217 | -1.624 |
| -1.644349999999965 | -16.781 | -5.204 | -1.626 |
| -1.640399999999965 | -16.753 | -5.191 | -1.629 |
| -1.636449999999965 | -16.724 | -5.178 | -1.632 |
| -1.632499999999965 | -16.695 | -5.165 | -1.635 |
| -1.628549999999965 | -16.666 | -5.152 | -1.638 |
| -1.624599999999965 | -16.638 | -5.139 | -1.641 |
| -1.620649999999965 | -16.609 | -5.127 | -1.644 |
| -1.616699999999966 | -16.581 | -5.114 | -1.647 |
| -1.612749999999966 | -16.552 | -5.101 | -1.65 |
| -1.608799999999966 | -16.523 | -5.088 | -1.653 |
| -1.604849999999966 | -16.495 | -5.076 | -1.656 |
| -1.600899999999966 | -16.466 | -5.063 | -1.659 |
| -1.596949999999966 | -16.438 | -5.05 | -1.662 |
| -1.592999999999966 | -16.41 | -5.038 | -1.666 |
| -1.589049999999966 | -16.381 | -5.025 | -1.669 |
| -1.585099999999966 | -16.353 | -5.013 | -1.672 |
| -1.581149999999967 | -16.325 | -5 | -1.675 |
| -1.577199999999967 | -16.296 | -4.988 | -1.679 |
| -1.573249999999967 | -16.268 | -4.975 | -1.682 |
| -1.569299999999967 | -16.24 | -4.963 | -1.686 |
| -1.565349999999967 | -16.212 | -4.95 | -1.689 |
| -1.561399999999967 | -16.184 | -4.938 | -1.692 |
| -1.557449999999967 | -16.155 | -4.926 | -1.696 |
| -1.553499999999967 | -16.127 | -4.913 | -1.699 |
| -1.549549999999967 | -16.099 | -4.901 | -1.703 |
| -1.545599999999967 | -16.071 | -4.889 | -1.706 |
| -1.541649999999968 | -16.043 | -4.877 | -1.71 |
| -1.537699999999968 | -16.015 | -4.865 | -1.714 |
| -1.533749999999968 | -15.987 | -4.852 | -1.717 |
| -1.529799999999968 | -15.959 | -4.84 | -1.721 |
| -1.525849999999968 | -15.932 | -4.828 | -1.725 |
| -1.521899999999968 | -15.904 | -4.816 | -1.729 |
| -1.517949999999968 | -15.876 | -4.804 | -1.732 |
| -1.513999999999968 | -15.848 | -4.792 | -1.736 |
| -1.510049999999968 | -15.82 | -4.78 | -1.74 |
| -1.506099999999968 | -15.793 | -4.768 | -1.744 |
| -1.502149999999969 | -15.765 | -4.756 | -1.748 |
| -1.498199999999969 | -15.737 | -4.745 | -1.752 |
| -1.494249999999969 | -15.71 | -4.733 | -1.756 |
| -1.490299999999969 | -15.682 | -4.721 | -1.76 |
| -1.486349999999969 | -15.655 | -4.709 | -1.764 |
| -1.482399999999969 | -15.627 | -4.698 | -1.768 |
| -1.478449999999969 | -15.6 | -4.686 | -1.772 |
| -1.474499999999969 | -15.572 | -4.674 | -1.776 |
| -1.470549999999969 | -15.545 | -4.663 | -1.78 |
| -1.466599999999969 | -15.517 | -4.651 | -1.785 |
| -1.46264999999997 | -15.49 | -4.639 | -1.789 |
| -1.45869999999997 | -15.463 | -4.628 | -1.793 |
| -1.45474999999997 | -15.435 | -4.616 | -1.797 |
| -1.45079999999997 | -15.408 | -4.605 | -1.802 |
| -1.44684999999997 | -15.381 | -4.593 | -1.806 |
| -1.44289999999997 | -15.354 | -4.582 | -1.81 |
| -1.43894999999997 | -15.326 | -4.571 | -1.815 |
| -1.43499999999997 | -15.299 | -4.559 | -1.819 |
| -1.43104999999997 | -15.272 | -4.548 | -1.824 |
| -1.42709999999997 | -15.245 | -4.537 | -1.828 |
| -1.423149999999971 | -15.218 | -4.525 | -1.833 |
| -1.419199999999971 | -15.191 | -4.514 | -1.837 |
| -1.415249999999971 | -15.164 | -4.503 | -1.842 |
| -1.411299999999971 | -15.137 | -4.492 | -1.847 |
| -1.407349999999971 | -15.11 | -4.481 | -1.851 |
| -1.403399999999971 | -15.083 | -4.47 | -1.856 |
| -1.399449999999971 | -15.056 | -4.458 | -1.861 |
| -1.395499999999971 | -15.029 | -4.447 | -1.865 |
| -1.391549999999971 | -15.003 | -4.436 | -1.87 |
| -1.387599999999971 | -14.976 | -4.425 | -1.875 |
| -1.383649999999972 | -14.949 | -4.414 | -1.88 |
| -1.379699999999972 | -14.922 | -4.404 | -1.885 |
| -1.375749999999972 | -14.896 | -4.393 | -1.89 |
| -1.371799999999972 | -14.869 | -4.382 | -1.895 |
| -1.367849999999972 | -14.842 | -4.371 | -1.9 |
| -1.363899999999972 | -14.816 | -4.36 | -1.905 |
| -1.359949999999972 | -14.789 | -4.349 | -1.91 |
| -1.355999999999972 | -14.763 | -4.339 | -1.915 |
| -1.352049999999972 | -14.736 | -4.328 | -1.92 |
| -1.348099999999972 | -14.71 | -4.317 | -1.925 |
| -1.344149999999973 | -14.683 | -4.307 | -1.93 |
| -1.340199999999973 | -14.657 | -4.296 | -1.935 |
| -1.336249999999973 | -14.631 | -4.286 | -1.941 |
| -1.332299999999973 | -14.604 | -4.275 | -1.946 |
| -1.328349999999973 | -14.578 | -4.265 | -1.951 |
| -1.324399999999973 | -14.552 | -4.254 | -1.956 |
| -1.320449999999973 | -14.525 | -4.244 | -1.962 |
| -1.316499999999973 | -14.499 | -4.233 | -1.967 |
| -1.312549999999973 | -14.473 | -4.223 | -1.973 |
| -1.308599999999974 | -14.447 | -4.212 | -1.978 |
| -1.304649999999974 | -14.421 | -4.202 | -1.984 |
| -1.300699999999974 | -14.395 | -4.192 | -1.989 |
| -1.296749999999974 | -14.369 | -4.182 | -1.995 |
| -1.292799999999974 | -14.343 | -4.171 | -2 |
| -1.288849999999974 | -14.317 | -4.161 | -2.006 |
| -1.284899999999974 | -14.291 | -4.151 | -2.011 |
| -1.280949999999974 | -14.265 | -4.141 | -2.017 |
| -1.276999999999974 | -14.239 | -4.131 | -2.023 |
| -1.273049999999974 | -14.213 | -4.121 | -2.028 |
| -1.269099999999975 | -14.187 | -4.111 | -2.034 |
| -1.265149999999975 | -14.161 | -4.101 | -2.04 |
| -1.261199999999975 | -14.135 | -4.091 | -2.046 |
| -1.257249999999975 | -14.11 | -4.081 | -2.052 |
| -1.253299999999975 | -14.084 | -4.071 | -2.058 |
| -1.249349999999975 | -14.058 | -4.061 | -2.063 |
| -1.245399999999975 | -14.033 | -4.051 | -2.069 |
| -1.241449999999975 | -14.007 | -4.041 | -2.075 |
| -1.237499999999975 | -13.981 | -4.031 | -2.081 |
| -1.233549999999975 | -13.956 | -4.022 | -2.087 |
| -1.229599999999976 | -13.93 | -4.012 | -2.094 |
| -1.225649999999976 | -13.905 | -4.002 | -2.1 |
| -1.221699999999976 | -13.879 | -3.993 | -2.106 |
| -1.217749999999976 | -13.854 | -3.983 | -2.112 |
| -1.213799999999976 | -13.829 | -3.973 | -2.118 |
| -1.209849999999976 | -13.803 | -3.964 | -2.124 |
| -1.205899999999976 | -13.778 | -3.954 | -2.131 |
| -1.201949999999976 | -13.752 | -3.945 | -2.137 |
| -1.197999999999976 | -13.727 | -3.935 | -2.143 |
| -1.194049999999976 | -13.702 | -3.926 | -2.15 |
| -1.190099999999977 | -13.677 | -3.916 | -2.156 |
| -1.186149999999977 | -13.652 | -3.907 | -2.162 |
| -1.182199999999977 | -13.626 | -3.898 | -2.169 |
| -1.178249999999977 | -13.601 | -3.888 | -2.175 |
| -1.174299999999977 | -13.576 | -3.879 | -2.182 |
| -1.170349999999977 | -13.551 | -3.87 | -2.188 |
| -1.166399999999977 | -13.526 | -3.86 | -2.195 |
| -1.162449999999977 | -13.501 | -3.851 | -2.201 |
| -1.158499999999977 | -13.476 | -3.842 | -2.208 |
| -1.154549999999978 | -13.451 | -3.833 | -2.215 |
| -1.150599999999978 | -13.426 | -3.824 | -2.221 |
| -1.146649999999978 | -13.401 | -3.815 | -2.228 |
| -1.142699999999978 | -13.377 | -3.806 | -2.235 |
| -1.138749999999978 | -13.352 | -3.797 | -2.242 |
| -1.134799999999978 | -13.327 | -3.788 | -2.249 |
| -1.130849999999978 | -13.302 | -3.779 | -2.255 |
| -1.126899999999978 | -13.278 | -3.77 | -2.262 |
| -1.122949999999978 | -13.253 | -3.761 | -2.269 |
| -1.118999999999978 | -13.228 | -3.752 | -2.276 |
| -1.115049999999979 | -13.204 | -3.743 | -2.283 |
| -1.111099999999979 | -13.179 | -3.735 | -2.29 |
| -1.107149999999979 | -13.154 | -3.726 | -2.297 |
| -1.103199999999979 | -13.13 | -3.717 | -2.304 |
| -1.099249999999979 | -13.105 | -3.708 | -2.311 |
| -1.095299999999979 | -13.081 | -3.7 | -2.318 |
| -1.091349999999979 | -13.056 | -3.691 | -2.326 |
| -1.087399999999979 | -13.032 | -3.682 | -2.333 |
| -1.083449999999979 | -13.008 | -3.674 | -2.34 |
| -1.079499999999979 | -12.983 | -3.665 | -2.347 |
| -1.07554999999998 | -12.959 | -3.657 | -2.355 |
| -1.07159999999998 | -12.935 | -3.648 | -2.362 |
| -1.06764999999998 | -12.91 | -3.64 | -2.369 |
| -1.06369999999998 | -12.886 | -3.631 | -2.377 |
| -1.05974999999998 | -12.862 | -3.623 | -2.384 |
| -1.05579999999998 | -12.838 | -3.615 | -2.392 |
| -1.05184999999998 | -12.814 | -3.606 | -2.399 |
| -1.04789999999998 | -12.79 | -3.598 | -2.406 |
| -1.04394999999998 | -12.766 | -3.59 | -2.414 |
| -1.03999999999998 | -12.742 | -3.582 | -2.422 |
| -1.036049999999981 | -12.718 | -3.573 | -2.429 |
| -1.032099999999981 | -12.694 | -3.565 | -2.437 |
| -1.028149999999981 | -12.67 | -3.557 | -2.444 |
| -1.024199999999981 | -12.646 | -3.549 | -2.452 |
| -1.020249999999981 | -12.622 | -3.541 | -2.46 |
| -1.016299999999981 | -12.598 | -3.533 | -2.468 |
| -1.012349999999981 | -12.574 | -3.525 | -2.475 |
| -1.008399999999981 | -12.55 | -3.517 | -2.483 |
| -1.004449999999981 | -12.527 | -3.509 | -2.491 |
| -1.000499999999982 | -12.503 | -3.501 | -2.499 |
| -0.996549999999981 | -12.479 | -3.493 | -2.507 |
| -0.992599999999981 | -12.456 | -3.485 | -2.515 |
| -0.988649999999981 | -12.432 | -3.477 | -2.523 |
| -0.984699999999981 | -12.408 | -3.47 | -2.531 |
| -0.980749999999981 | -12.385 | -3.462 | -2.539 |
| -0.976799999999981 | -12.361 | -3.454 | -2.547 |
| -0.972849999999981 | -12.338 | -3.446 | -2.555 |
| -0.968899999999981 | -12.314 | -3.439 | -2.563 |
| -0.964949999999981 | -12.291 | -3.431 | -2.571 |
| -0.960999999999981 | -12.268 | -3.424 | -2.58 |
| -0.957049999999981 | -12.244 | -3.416 | -2.588 |
| -0.953099999999981 | -12.221 | -3.408 | -2.596 |
| -0.949149999999981 | -12.197 | -3.401 | -2.604 |
| -0.945199999999981 | -12.174 | -3.393 | -2.613 |
| -0.941249999999981 | -12.151 | -3.386 | -2.621 |
| -0.937299999999981 | -12.128 | -3.379 | -2.629 |
| -0.933349999999981 | -12.105 | -3.371 | -2.638 |
| -0.929399999999981 | -12.081 | -3.364 | -2.646 |
| -0.925449999999981 | -12.058 | -3.356 | -2.655 |
| -0.921499999999981 | -12.035 | -3.349 | -2.663 |
| -0.917549999999981 | -12.012 | -3.342 | -2.672 |
| -0.913599999999981 | -11.989 | -3.335 | -2.68 |
| -0.909649999999981 | -11.966 | -3.327 | -2.689 |
| -0.905699999999981 | -11.943 | -3.32 | -2.697 |
| -0.901749999999981 | -11.92 | -3.313 | -2.706 |
| -0.897799999999981 | -11.897 | -3.306 | -2.715 |
| -0.893849999999981 | -11.874 | -3.299 | -2.724 |
| -0.889899999999981 | -11.852 | -3.292 | -2.732 |
| -0.885949999999981 | -11.829 | -3.285 | -2.741 |
| -0.881999999999981 | -11.806 | -3.278 | -2.75 |
| -0.878049999999981 | -11.783 | -3.271 | -2.759 |
| -0.874099999999981 | -11.76 | -3.264 | -2.768 |
| -0.870149999999981 | -11.738 | -3.257 | -2.777 |
| -0.866199999999981 | -11.715 | -3.25 | -2.786 |
| -0.862249999999981 | -11.692 | -3.243 | -2.794 |
| -0.858299999999981 | -11.67 | -3.237 | -2.803 |
| -0.854349999999981 | -11.647 | -3.23 | -2.813 |
| -0.850399999999981 | -11.625 | -3.223 | -2.822 |
| -0.846449999999981 | -11.602 | -3.216 | -2.831 |
| -0.842499999999981 | -11.58 | -3.21 | -2.84 |
| -0.838549999999981 | -11.557 | -3.203 | -2.849 |
| -0.834599999999981 | -11.535 | -3.197 | -2.858 |
| -0.830649999999981 | -11.513 | -3.19 | -2.867 |
| -0.826699999999981 | -11.49 | -3.183 | -2.877 |
| -0.822749999999981 | -11.468 | -3.177 | -2.886 |
| -0.818799999999981 | -11.446 | -3.17 | -2.895 |
| -0.814849999999981 | -11.423 | -3.164 | -2.905 |
| -0.810899999999981 | -11.401 | -3.158 | -2.914 |
| -0.806949999999981 | -11.379 | -3.151 | -2.923 |
| -0.802999999999981 | -11.357 | -3.145 | -2.933 |
| -0.799049999999981 | -11.335 | -3.138 | -2.942 |
| -0.795099999999981 | -11.313 | -3.132 | -2.952 |
| -0.791149999999981 | -11.291 | -3.126 | -2.961 |
| -0.787199999999981 | -11.268 | -3.12 | -2.971 |
| -0.783249999999981 | -11.246 | -3.113 | -2.98 |
| -0.779299999999981 | -11.225 | -3.107 | -2.99 |
| -0.775349999999981 | -11.203 | -3.101 | -3 |
| -0.771399999999981 | -11.181 | -3.095 | -3.009 |
| -0.767449999999981 | -11.159 | -3.089 | -3.019 |
| -0.763499999999981 | -11.137 | -3.083 | -3.029 |
| -0.759549999999981 | -11.115 | -3.077 | -3.039 |
| -0.755599999999981 | -11.093 | -3.071 | -3.049 |
| -0.751649999999981 | -11.072 | -3.065 | -3.058 |
| -0.747699999999981 | -11.05 | -3.059 | -3.068 |
| -0.743749999999981 | -11.028 | -3.053 | -3.078 |
| -0.739799999999981 | -11.007 | -3.047 | -3.088 |
| -0.735849999999981 | -10.985 | -3.041 | -3.098 |
| -0.731899999999981 | -10.963 | -3.036 | -3.108 |
| -0.727949999999981 | -10.942 | -3.03 | -3.118 |
| -0.723999999999981 | -10.92 | -3.024 | -3.128 |
| -0.720049999999981 | -10.899 | -3.018 | -3.138 |
| -0.716099999999981 | -10.877 | -3.013 | -3.148 |
| -0.712149999999981 | -10.856 | -3.007 | -3.159 |
| -0.708199999999981 | -10.834 | -3.002 | -3.169 |
| -0.704249999999981 | -10.813 | -2.996 | -3.179 |
| -0.700299999999981 | -10.792 | -2.99 | -3.189 |
| -0.696349999999981 | -10.77 | -2.985 | -3.2 |
| -0.692399999999981 | -10.749 | -2.979 | -3.21 |
| -0.688449999999981 | -10.728 | -2.974 | -3.22 |
| -0.684499999999981 | -10.707 | -2.969 | -3.231 |
| -0.680549999999981 | -10.685 | -2.963 | -3.241 |
| -0.676599999999981 | -10.664 | -2.958 | -3.251 |
| -0.672649999999981 | -10.643 | -2.952 | -3.262 |
| -0.668699999999981 | -10.622 | -2.947 | -3.272 |
| -0.664749999999981 | -10.601 | -2.942 | -3.283 |
| -0.660799999999981 | -10.58 | -2.937 | -3.293 |
| -0.656849999999981 | -10.559 | -2.931 | -3.304 |
| -0.652899999999981 | -10.538 | -2.926 | -3.315 |
| -0.648949999999981 | -10.517 | -2.921 | -3.325 |
| -0.644999999999981 | -10.496 | -2.916 | -3.336 |
| -0.641049999999981 | -10.475 | -2.911 | -3.347 |
| -0.637099999999981 | -10.454 | -2.906 | -3.357 |
| -0.633149999999981 | -10.433 | -2.901 | -3.368 |
| -0.629199999999981 | -10.413 | -2.896 | -3.379 |
| -0.625249999999981 | -10.392 | -2.891 | -3.39 |
| -0.621299999999981 | -10.371 | -2.886 | -3.401 |
| -0.617349999999981 | -10.351 | -2.881 | -3.412 |
| -0.613399999999981 | -10.33 | -2.876 | -3.423 |
| -0.609449999999981 | -10.309 | -2.871 | -3.434 |
| -0.605499999999981 | -10.289 | -2.867 | -3.445 |
| -0.601549999999981 | -10.268 | -2.862 | -3.456 |
| -0.597599999999981 | -10.248 | -2.857 | -3.467 |
| -0.593649999999981 | -10.227 | -2.852 | -3.478 |
| -0.589699999999981 | -10.207 | -2.848 | -3.489 |
| -0.585749999999981 | -10.186 | -2.843 | -3.5 |
| -0.581799999999981 | -10.166 | -2.838 | -3.511 |
| -0.577849999999981 | -10.145 | -2.834 | -3.523 |
| -0.573899999999981 | -10.125 | -2.829 | -3.534 |
| -0.569949999999981 | -10.105 | -2.825 | -3.545 |
| -0.565999999999981 | -10.084 | -2.82 | -3.556 |
| -0.56204999999998 | -10.064 | -2.816 | -3.568 |
| -0.55809999999998 | -10.044 | -2.811 | -3.579 |
| -0.55414999999998 | -10.024 | -2.807 | -3.59 |
| -0.55019999999998 | -10.004 | -2.803 | -3.602 |
| -0.54624999999998 | -9.983 | -2.798 | -3.613 |
| -0.54229999999998 | -9.963 | -2.794 | -3.625 |
| -0.53834999999998 | -9.943 | -2.79 | -3.636 |
| -0.53439999999998 | -9.923 | -2.786 | -3.648 |
| -0.53044999999998 | -9.903 | -2.781 | -3.66 |
| -0.52649999999998 | -9.883 | -2.777 | -3.671 |
| -0.52254999999998 | -9.863 | -2.773 | -3.683 |
| -0.51859999999998 | -9.843 | -2.769 | -3.695 |
| -0.51464999999998 | -9.823 | -2.765 | -3.706 |
| -0.51069999999998 | -9.804 | -2.761 | -3.718 |
| -0.50674999999998 | -9.784 | -2.757 | -3.73 |
| -0.50279999999998 | -9.764 | -2.753 | -3.742 |
| -0.49884999999998 | -9.744 | -2.749 | -3.753 |
| -0.49489999999998 | -9.725 | -2.745 | -3.765 |
| -0.49094999999998 | -9.705 | -2.741 | -3.777 |
| -0.48699999999998 | -9.685 | -2.737 | -3.789 |
| -0.48304999999998 | -9.666 | -2.733 | -3.801 |
| -0.47909999999998 | -9.646 | -2.73 | -3.813 |
| -0.47514999999998 | -9.626 | -2.726 | -3.825 |
| -0.47119999999998 | -9.607 | -2.722 | -3.837 |
| -0.46724999999998 | -9.587 | -2.718 | -3.849 |
| -0.46329999999998 | -9.568 | -2.715 | -3.861 |
| -0.45934999999998 | -9.548 | -2.711 | -3.874 |
| -0.45539999999998 | -9.529 | -2.707 | -3.886 |
| -0.45144999999998 | -9.51 | -2.704 | -3.898 |
| -0.44749999999998 | -9.49 | -2.7 | -3.91 |
| -0.44354999999998 | -9.471 | -2.697 | -3.923 |
| -0.43959999999998 | -9.452 | -2.693 | -3.935 |
| -0.43564999999998 | -9.432 | -2.69 | -3.947 |
| -0.43169999999998 | -9.413 | -2.686 | -3.96 |
| -0.42774999999998 | -9.394 | -2.683 | -3.972 |
| -0.42379999999998 | -9.375 | -2.68 | -3.984 |
| -0.41984999999998 | -9.356 | -2.676 | -3.997 |
| -0.41589999999998 | -9.337 | -2.673 | -4.009 |
| -0.41194999999998 | -9.318 | -2.67 | -4.022 |
| -0.40799999999998 | -9.298 | -2.666 | -4.034 |
| -0.40404999999998 | -9.279 | -2.663 | -4.047 |
| -0.40009999999998 | -9.26 | -2.66 | -4.06 |
| -0.39614999999998 | -9.242 | -2.657 | -4.072 |
| -0.39219999999998 | -9.223 | -2.654 | -4.085 |
| -0.38824999999998 | -9.204 | -2.651 | -4.098 |
| -0.38429999999998 | -9.185 | -2.648 | -4.11 |
| -0.38034999999998 | -9.166 | -2.645 | -4.123 |
| -0.37639999999998 | -9.147 | -2.642 | -4.136 |
| -0.37244999999998 | -9.129 | -2.639 | -4.149 |
| -0.36849999999998 | -9.11 | -2.636 | -4.162 |
| -0.36454999999998 | -9.091 | -2.633 | -4.175 |
| -0.36059999999998 | -9.072 | -2.63 | -4.188 |
| -0.35664999999998 | -9.054 | -2.627 | -4.201 |
| -0.35269999999998 | -9.035 | -2.624 | -4.214 |
| -0.34874999999998 | -9.017 | -2.622 | -4.227 |
| -0.34479999999998 | -8.998 | -2.619 | -4.24 |
| -0.34084999999998 | -8.98 | -2.616 | -4.253 |
| -0.33689999999998 | -8.961 | -2.614 | -4.266 |
| -0.33294999999998 | -8.943 | -2.611 | -4.279 |
| -0.32899999999998 | -8.924 | -2.608 | -4.292 |
| -0.32504999999998 | -8.906 | -2.606 | -4.305 |
| -0.32109999999998 | -8.888 | -2.603 | -4.319 |
| -0.31714999999998 | -8.869 | -2.601 | -4.332 |
| -0.31319999999998 | -8.851 | -2.598 | -4.345 |
| -0.30924999999998 | -8.833 | -2.596 | -4.359 |
| -0.30529999999998 | -8.814 | -2.593 | -4.372 |
| -0.30134999999998 | -8.796 | -2.591 | -4.385 |
| -0.29739999999998 | -8.778 | -2.588 | -4.399 |
| -0.29344999999998 | -8.76 | -2.586 | -4.412 |
| -0.28949999999998 | -8.742 | -2.584 | -4.426 |
| -0.28554999999998 | -8.724 | -2.582 | -4.439 |
| -0.28159999999998 | -8.706 | -2.579 | -4.453 |
| -0.27764999999998 | -8.688 | -2.577 | -4.466 |
| -0.27369999999998 | -8.67 | -2.575 | -4.48 |
| -0.26974999999998 | -8.652 | -2.573 | -4.494 |
| -0.26579999999998 | -8.634 | -2.571 | -4.507 |
| -0.26184999999998 | -8.616 | -2.569 | -4.521 |
| -0.25789999999998 | -8.598 | -2.567 | -4.535 |
| -0.25394999999998 | -8.58 | -2.564 | -4.549 |
| -0.24999999999998 | -8.562 | -2.562 | -4.563 |
| -0.24604999999998 | -8.545 | -2.561 | -4.576 |
| -0.24209999999998 | -8.527 | -2.559 | -4.59 |
| -0.23814999999998 | -8.509 | -2.557 | -4.604 |
| -0.23419999999998 | -8.492 | -2.555 | -4.618 |
| -0.23024999999998 | -8.474 | -2.553 | -4.632 |
| -0.22629999999998 | -8.456 | -2.551 | -4.646 |
| -0.22234999999998 | -8.439 | -2.549 | -4.66 |
| -0.21839999999998 | -8.421 | -2.548 | -4.674 |
| -0.21444999999998 | -8.404 | -2.546 | -4.688 |
| -0.21049999999998 | -8.386 | -2.544 | -4.702 |
| -0.20654999999998 | -8.369 | -2.543 | -4.716 |
| -0.20259999999998 | -8.351 | -2.541 | -4.731 |
| -0.19864999999998 | -8.334 | -2.539 | -4.745 |
| -0.19469999999998 | -8.317 | -2.538 | -4.759 |
| -0.19074999999998 | -8.299 | -2.536 | -4.773 |
| -0.18679999999998 | -8.282 | -2.535 | -4.788 |
| -0.18284999999998 | -8.265 | -2.533 | -4.802 |
| -0.17889999999998 | -8.248 | -2.532 | -4.816 |
| -0.17494999999998 | -8.23 | -2.531 | -4.831 |
| -0.17099999999998 | -8.213 | -2.529 | -4.845 |
| -0.16704999999998 | -8.196 | -2.528 | -4.86 |
| -0.16309999999998 | -8.179 | -2.527 | -4.874 |
| -0.15914999999998 | -8.162 | -2.525 | -4.889 |
| -0.15519999999998 | -8.145 | -2.524 | -4.903 |
| -0.15124999999998 | -8.128 | -2.523 | -4.918 |
| -0.14729999999998 | -8.111 | -2.522 | -4.932 |
| -0.14334999999998 | -8.094 | -2.521 | -4.947 |
| -0.13939999999998 | -8.077 | -2.519 | -4.962 |
| -0.13544999999998 | -8.06 | -2.518 | -4.977 |
| -0.13149999999998 | -8.043 | -2.517 | -4.991 |
| -0.12754999999998 | -8.026 | -2.516 | -5.006 |
| -0.12359999999998 | -8.01 | -2.515 | -5.021 |
| -0.11964999999998 | -7.993 | -2.514 | -5.036 |
| -0.11569999999998 | -7.976 | -2.513 | -5.051 |
| -0.11174999999998 | -7.959 | -2.512 | -5.065 |
| -0.10779999999998 | -7.943 | -2.512 | -5.08 |
| -0.10384999999998 | -7.926 | -2.511 | -5.095 |
| -0.0998999999999795 | -7.91 | -2.51 | -5.11 |
| -0.0959499999999795 | -7.893 | -2.509 | -5.125 |
| -0.0919999999999795 | -7.876 | -2.508 | -5.14 |
| -0.0880499999999795 | -7.86 | -2.508 | -5.156 |
| -0.0840999999999795 | -7.843 | -2.507 | -5.171 |
| -0.0801499999999796 | -7.827 | -2.506 | -5.186 |
| -0.0761999999999796 | -7.811 | -2.506 | -5.201 |
| -0.0722499999999796 | -7.794 | -2.505 | -5.216 |
| -0.0682999999999796 | -7.778 | -2.505 | -5.231 |
| -0.0643499999999796 | -7.762 | -2.504 | -5.247 |
| -0.0603999999999796 | -7.745 | -2.504 | -5.262 |
| -0.0564499999999796 | -7.729 | -2.503 | -5.277 |
| -0.0524999999999796 | -7.713 | -2.503 | -5.293 |
| -0.0485499999999796 | -7.697 | -2.502 | -5.308 |
| -0.0445999999999796 | -7.68 | -2.502 | -5.324 |
| -0.0406499999999796 | -7.664 | -2.502 | -5.339 |
| -0.0366999999999796 | -7.648 | -2.501 | -5.355 |
| -0.0327499999999796 | -7.632 | -2.501 | -5.37 |
| -0.0287999999999796 | -7.616 | -2.501 | -5.386 |
| -0.0248499999999796 | -7.6 | -2.501 | -5.401 |
| -0.0208999999999796 | -7.584 | -2.5 | -5.417 |
| -0.0169499999999796 | -7.568 | -2.5 | -5.432 |
| -0.0129999999999796 | -7.552 | -2.5 | -5.448 |
| -0.00904999999997956 | -7.536 | -2.5 | -5.464 |
| -0.00509999999997956 | -7.52 | -2.5 | -5.48 |
| -0.00114999999997956 | -7.505 | -2.5 | -5.495 |
| 0.00280000000002044 | -7.489 | -2.5 | -5.511 |
| 0.00675000000002044 | -7.473 | -2.5 | -5.527 |
| 0.0107000000000204 | -7.457 | -2.5 | -5.543 |
| 0.0146500000000204 | -7.442 | -2.5 | -5.559 |
| 0.0186000000000204 | -7.426 | -2.5 | -5.575 |
| 0.0225500000000204 | -7.41 | -2.501 | -5.591 |
| 0.0265000000000204 | -7.395 | -2.501 | -5.607 |
| 0.0304500000000204 | -7.379 | -2.501 | -5.623 |
| 0.0344000000000204 | -7.364 | -2.501 | -5.639 |
| 0.0383500000000204 | -7.348 | -2.501 | -5.655 |
| 0.0423000000000204 | -7.333 | -2.502 | -5.671 |
| 0.0462500000000204 | -7.317 | -2.502 | -5.687 |
| 0.0502000000000204 | -7.302 | -2.503 | -5.703 |
| 0.0541500000000204 | -7.286 | -2.503 | -5.72 |
| 0.0581000000000205 | -7.271 | -2.503 | -5.736 |
| 0.0620500000000205 | -7.256 | -2.504 | -5.752 |
| 0.0660000000000204 | -7.24 | -2.504 | -5.768 |
| 0.0699500000000204 | -7.225 | -2.505 | -5.785 |
| 0.0739000000000204 | -7.21 | -2.505 | -5.801 |
| 0.0778500000000204 | -7.195 | -2.506 | -5.817 |
| 0.0818000000000204 | -7.179 | -2.507 | -5.834 |
| 0.0857500000000204 | -7.164 | -2.507 | -5.85 |
| 0.0897000000000204 | -7.149 | -2.508 | -5.867 |
| 0.0936500000000204 | -7.134 | -2.509 | -5.883 |
| 0.0976000000000204 | -7.119 | -2.51 | -5.9 |
| 0.10155000000002 | -7.104 | -2.51 | -5.917 |
| 0.10550000000002 | -7.089 | -2.511 | -5.933 |
| 0.10945000000002 | -7.074 | -2.512 | -5.95 |
| 0.11340000000002 | -7.059 | -2.513 | -5.966 |
| 0.11735000000002 | -7.044 | -2.514 | -5.983 |
| 0.12130000000002 | -7.03 | -2.515 | -6 |
| 0.12525000000002 | -7.015 | -2.516 | -6.017 |
| 0.12920000000002 | -7 | -2.517 | -6.033 |
| 0.13315000000002 | -6.985 | -2.518 | -6.05 |
| 0.13710000000002 | -6.97 | -2.519 | -6.067 |
| 0.14105000000002 | -6.956 | -2.52 | -6.084 |
| 0.14500000000002 | -6.941 | -2.521 | -6.101 |
| 0.14895000000002 | -6.926 | -2.522 | -6.118 |
| 0.15290000000002 | -6.912 | -2.523 | -6.135 |
| 0.15685000000002 | -6.897 | -2.525 | -6.152 |
| 0.16080000000002 | -6.883 | -2.526 | -6.169 |
| 0.16475000000002 | -6.868 | -2.527 | -6.186 |
| 0.16870000000002 | -6.854 | -2.528 | -6.203 |
| 0.17265000000002 | -6.839 | -2.53 | -6.22 |
| 0.176600000000021 | -6.825 | -2.531 | -6.238 |
| 0.180550000000021 | -6.81 | -2.533 | -6.255 |
| 0.184500000000021 | -6.796 | -2.534 | -6.272 |
| 0.188450000000021 | -6.782 | -2.536 | -6.289 |
| 0.192400000000021 | -6.767 | -2.537 | -6.307 |
| 0.196350000000021 | -6.753 | -2.539 | -6.324 |
| 0.200300000000021 | -6.739 | -2.54 | -6.341 |
| 0.204250000000021 | -6.725 | -2.542 | -6.359 |
| 0.208200000000021 | -6.711 | -2.543 | -6.376 |
| 0.212150000000021 | -6.696 | -2.545 | -6.394 |
| 0.216100000000021 | -6.682 | -2.547 | -6.411 |
| 0.220050000000021 | -6.668 | -2.548 | -6.429 |
| 0.224000000000021 | -6.654 | -2.55 | -6.446 |
| 0.227950000000021 | -6.64 | -2.552 | -6.464 |
| 0.231900000000021 | -6.626 | -2.554 | -6.481 |
| 0.235850000000021 | -6.612 | -2.556 | -6.499 |
| 0.239800000000021 | -6.598 | -2.558 | -6.517 |
| 0.243750000000021 | -6.584 | -2.559 | -6.534 |
| 0.247700000000021 | -6.571 | -2.561 | -6.552 |
| 0.251650000000021 | -6.557 | -2.563 | -6.57 |
| 0.255600000000021 | -6.543 | -2.565 | -6.588 |
| 0.259550000000021 | -6.529 | -2.567 | -6.606 |
| 0.263500000000021 | -6.515 | -2.569 | -6.623 |
| 0.267450000000021 | -6.502 | -2.572 | -6.641 |
| 0.271400000000021 | -6.488 | -2.574 | -6.659 |
| 0.275350000000021 | -6.474 | -2.576 | -6.677 |
| 0.279300000000021 | -6.461 | -2.578 | -6.695 |
| 0.283250000000021 | -6.447 | -2.58 | -6.713 |
| 0.287200000000021 | -6.434 | -2.582 | -6.731 |
| 0.291150000000021 | -6.42 | -2.585 | -6.749 |
| 0.295100000000021 | -6.407 | -2.587 | -6.767 |
| 0.299050000000021 | -6.393 | -2.589 | -6.786 |
| 0.303000000000021 | -6.38 | -2.592 | -6.804 |
| 0.306950000000021 | -6.366 | -2.594 | -6.822 |
| 0.310900000000021 | -6.353 | -2.597 | -6.84 |
| 0.314850000000021 | -6.34 | -2.599 | -6.859 |
| 0.318800000000021 | -6.326 | -2.602 | -6.877 |
| 0.322750000000021 | -6.313 | -2.604 | -6.895 |
| 0.326700000000021 | -6.3 | -2.607 | -6.914 |
| 0.330650000000021 | -6.287 | -2.609 | -6.932 |
| 0.334600000000021 | -6.274 | -2.612 | -6.95 |
| 0.338550000000021 | -6.26 | -2.615 | -6.969 |
| 0.342500000000021 | -6.247 | -2.617 | -6.987 |
| 0.346450000000021 | -6.234 | -2.62 | -7.006 |
| 0.350400000000021 | -6.221 | -2.623 | -7.024 |
| 0.354350000000021 | -6.208 | -2.626 | -7.043 |
| 0.358300000000021 | -6.195 | -2.628 | -7.062 |
| 0.362250000000021 | -6.182 | -2.631 | -7.08 |
| 0.366200000000021 | -6.169 | -2.634 | -7.099 |
| 0.370150000000021 | -6.156 | -2.637 | -7.118 |
| 0.374100000000021 | -6.144 | -2.64 | -7.136 |
| 0.378050000000021 | -6.131 | -2.643 | -7.155 |
| 0.382000000000021 | -6.118 | -2.646 | -7.174 |
| 0.385950000000021 | -6.105 | -2.649 | -7.193 |
| 0.389900000000021 | -6.092 | -2.652 | -7.212 |
| 0.393850000000021 | -6.08 | -2.655 | -7.231 |
| 0.397800000000021 | -6.067 | -2.658 | -7.249 |
| 0.401750000000021 | -6.054 | -2.661 | -7.268 |
| 0.405700000000021 | -6.042 | -2.665 | -7.287 |
| 0.409650000000021 | -6.029 | -2.668 | -7.306 |
| 0.413600000000021 | -6.017 | -2.671 | -7.325 |
| 0.417550000000021 | -6.004 | -2.674 | -7.345 |
| 0.421500000000021 | -5.992 | -2.678 | -7.364 |
| 0.425450000000021 | -5.979 | -2.681 | -7.383 |
| 0.429400000000021 | -5.967 | -2.684 | -7.402 |
| 0.433350000000021 | -5.954 | -2.688 | -7.421 |
| 0.437300000000021 | -5.942 | -2.691 | -7.44 |
| 0.441250000000021 | -5.93 | -2.695 | -7.46 |
| 0.445200000000021 | -5.917 | -2.698 | -7.479 |
| 0.449150000000021 | -5.905 | -2.702 | -7.498 |
| 0.453100000000021 | -5.893 | -2.705 | -7.518 |
| 0.457050000000021 | -5.881 | -2.709 | -7.537 |
| 0.461000000000021 | -5.869 | -2.713 | -7.557 |
| 0.464950000000021 | -5.856 | -2.716 | -7.576 |
| 0.468900000000021 | -5.844 | -2.72 | -7.595 |
| 0.472850000000021 | -5.832 | -2.724 | -7.615 |
| 0.476800000000021 | -5.82 | -2.727 | -7.635 |
| 0.480750000000021 | -5.808 | -2.731 | -7.654 |
| 0.484700000000021 | -5.796 | -2.735 | -7.674 |
| 0.488650000000021 | -5.784 | -2.739 | -7.693 |
| 0.492600000000021 | -5.772 | -2.743 | -7.713 |
| 0.496550000000021 | -5.76 | -2.747 | -7.733 |
| 0.500500000000021 | -5.749 | -2.751 | -7.753 |
| 0.504450000000021 | -5.737 | -2.754 | -7.772 |
| 0.508400000000021 | -5.725 | -2.758 | -7.792 |
| 0.512350000000021 | -5.713 | -2.763 | -7.812 |
| 0.516300000000021 | -5.701 | -2.767 | -7.832 |
| 0.520250000000021 | -5.69 | -2.771 | -7.852 |
| 0.524200000000021 | -5.678 | -2.775 | -7.872 |
| 0.528150000000021 | -5.666 | -2.779 | -7.892 |
| 0.532100000000021 | -5.655 | -2.783 | -7.912 |
| 0.536050000000021 | -5.643 | -2.787 | -7.932 |
| 0.540000000000021 | -5.632 | -2.792 | -7.952 |
| 0.543950000000021 | -5.62 | -2.796 | -7.972 |
| 0.547900000000021 | -5.609 | -2.8 | -7.992 |
| 0.551850000000021 | -5.597 | -2.805 | -8.012 |
| 0.555800000000021 | -5.586 | -2.809 | -8.032 |
| 0.559750000000021 | -5.574 | -2.813 | -8.052 |
| 0.563700000000021 | -5.563 | -2.818 | -8.073 |
| 0.567650000000021 | -5.552 | -2.822 | -8.093 |
| 0.571600000000021 | -5.54 | -2.827 | -8.113 |
| 0.575550000000021 | -5.529 | -2.831 | -8.133 |
| 0.579500000000021 | -5.518 | -2.836 | -8.154 |
| 0.583450000000021 | -5.507 | -2.84 | -8.174 |
| 0.587400000000021 | -5.495 | -2.845 | -8.195 |
| 0.591350000000021 | -5.484 | -2.85 | -8.215 |
| 0.595300000000021 | -5.473 | -2.854 | -8.236 |
| 0.599250000000021 | -5.462 | -2.859 | -8.256 |
| 0.603200000000021 | -5.451 | -2.864 | -8.277 |
| 0.607150000000021 | -5.44 | -2.869 | -8.297 |
| 0.611100000000021 | -5.429 | -2.873 | -8.318 |
| 0.615050000000021 | -5.418 | -2.878 | -8.338 |
| 0.619000000000021 | -5.407 | -2.883 | -8.359 |
| 0.622950000000021 | -5.396 | -2.888 | -8.38 |
| 0.626900000000021 | -5.385 | -2.893 | -8.401 |
| 0.630850000000021 | -5.375 | -2.898 | -8.421 |
| 0.634800000000021 | -5.364 | -2.903 | -8.442 |
| 0.638750000000021 | -5.353 | -2.908 | -8.463 |
| 0.642700000000021 | -5.342 | -2.913 | -8.484 |
| 0.646650000000021 | -5.332 | -2.918 | -8.505 |
| 0.650600000000022 | -5.321 | -2.923 | -8.526 |
| 0.654550000000022 | -5.31 | -2.928 | -8.547 |
| 0.658500000000022 | -5.3 | -2.934 | -8.568 |
| 0.662450000000022 | -5.289 | -2.939 | -8.589 |
| 0.666400000000022 | -5.278 | -2.944 | -8.61 |
| 0.670350000000022 | -5.268 | -2.949 | -8.631 |
| 0.674300000000022 | -5.257 | -2.955 | -8.652 |
| 0.678250000000022 | -5.247 | -2.96 | -8.673 |
| 0.682200000000022 | -5.237 | -2.965 | -8.694 |
| 0.686150000000022 | -5.226 | -2.971 | -8.715 |
| 0.690100000000022 | -5.216 | -2.976 | -8.737 |
| 0.694050000000022 | -5.206 | -2.982 | -8.758 |
| 0.698000000000022 | -5.195 | -2.987 | -8.779 |
| 0.701950000000022 | -5.185 | -2.993 | -8.801 |
| 0.705900000000022 | -5.175 | -2.998 | -8.822 |
| 0.709850000000022 | -5.164 | -3.004 | -8.843 |
| 0.713800000000022 | -5.154 | -3.01 | -8.865 |
| 0.717750000000022 | -5.144 | -3.015 | -8.886 |
| 0.721700000000022 | -5.134 | -3.021 | -8.908 |
| 0.725650000000022 | -5.124 | -3.027 | -8.929 |
| 0.729600000000022 | -5.114 | -3.032 | -8.951 |
| 0.733550000000022 | -5.104 | -3.038 | -8.972 |
| 0.737500000000022 | -5.094 | -3.044 | -8.994 |
| 0.741450000000022 | -5.084 | -3.05 | -9.016 |
| 0.745400000000022 | -5.074 | -3.056 | -9.037 |
| 0.749350000000022 | -5.064 | -3.062 | -9.059 |
| 0.753300000000022 | -5.054 | -3.067 | -9.081 |
| 0.757250000000022 | -5.044 | -3.073 | -9.102 |
| 0.761200000000022 | -5.035 | -3.079 | -9.124 |
| 0.765150000000022 | -5.025 | -3.085 | -9.146 |
| 0.769100000000022 | -5.015 | -3.092 | -9.168 |
| 0.773050000000022 | -5.005 | -3.098 | -9.19 |
| 0.777000000000022 | -4.996 | -3.104 | -9.212 |
| 0.780950000000022 | -4.986 | -3.11 | -9.234 |
| 0.784900000000022 | -4.976 | -3.116 | -9.256 |
| 0.788850000000022 | -4.967 | -3.122 | -9.278 |
| 0.792800000000022 | -4.957 | -3.129 | -9.3 |
| 0.796750000000022 | -4.948 | -3.135 | -9.322 |
| 0.800700000000022 | -4.938 | -3.141 | -9.344 |
| 0.804650000000022 | -4.929 | -3.147 | -9.366 |
| 0.808600000000022 | -4.919 | -3.154 | -9.388 |
| 0.812550000000022 | -4.91 | -3.16 | -9.41 |
| 0.816500000000022 | -4.901 | -3.167 | -9.433 |
| 0.820450000000022 | -4.891 | -3.173 | -9.455 |
| 0.824400000000022 | -4.882 | -3.18 | -9.477 |
| 0.828350000000022 | -4.873 | -3.186 | -9.5 |
| 0.832300000000022 | -4.864 | -3.193 | -9.522 |
| 0.836250000000022 | -4.854 | -3.199 | -9.544 |
| 0.840200000000022 | -4.845 | -3.206 | -9.567 |
| 0.844150000000022 | -4.836 | -3.213 | -9.589 |
| 0.848100000000022 | -4.827 | -3.219 | -9.612 |
| 0.852050000000022 | -4.818 | -3.226 | -9.634 |
| 0.856000000000022 | -4.809 | -3.233 | -9.657 |
| 0.859950000000022 | -4.8 | -3.24 | -9.679 |
| 0.863900000000022 | -4.791 | -3.246 | -9.702 |
| 0.867850000000022 | -4.782 | -3.253 | -9.725 |
| 0.871800000000022 | -4.773 | -3.26 | -9.747 |
| 0.875750000000022 | -4.764 | -3.267 | -9.77 |
| 0.879700000000022 | -4.755 | -3.274 | -9.793 |
| 0.883650000000022 | -4.746 | -3.281 | -9.815 |
| 0.887600000000022 | -4.737 | -3.288 | -9.838 |
| 0.891550000000022 | -4.729 | -3.295 | -9.861 |
| 0.895500000000022 | -4.72 | -3.302 | -9.884 |
| 0.899450000000022 | -4.711 | -3.309 | -9.907 |
| 0.903400000000022 | -4.703 | -3.316 | -9.93 |
| 0.907350000000022 | -4.694 | -3.323 | -9.953 |
| 0.911300000000022 | -4.685 | -3.33 | -9.976 |
| 0.915250000000022 | -4.677 | -3.338 | -9.999 |
| 0.919200000000022 | -4.668 | -3.345 | -10.022 |
| 0.923150000000022 | -4.66 | -3.352 | -10.045 |
| 0.927100000000022 | -4.651 | -3.36 | -10.068 |
| 0.931050000000022 | -4.643 | -3.367 | -10.091 |
| 0.935000000000022 | -4.634 | -3.374 | -10.114 |
| 0.938950000000022 | -4.626 | -3.382 | -10.137 |
| 0.942900000000022 | -4.617 | -3.389 | -10.161 |
| 0.946850000000022 | -4.609 | -3.397 | -10.184 |
| 0.950800000000022 | -4.601 | -3.404 | -10.207 |
| 0.954750000000022 | -4.593 | -3.412 | -10.231 |
| 0.958700000000022 | -4.584 | -3.419 | -10.254 |
| 0.962650000000022 | -4.576 | -3.427 | -10.277 |
| 0.966600000000022 | -4.568 | -3.434 | -10.301 |
| 0.970550000000022 | -4.56 | -3.442 | -10.324 |
| 0.974500000000022 | -4.552 | -3.45 | -10.348 |
| 0.978450000000022 | -4.544 | -3.457 | -10.371 |
| 0.982400000000022 | -4.536 | -3.465 | -10.395 |
| 0.986350000000022 | -4.527 | -3.473 | -10.418 |
| 0.990300000000022 | -4.519 | -3.481 | -10.442 |
| 0.994250000000022 | -4.512 | -3.489 | -10.466 |
| 0.998200000000022 | -4.504 | -3.496 | -10.489 |
| 1.002150000000022 | -4.496 | -3.504 | -10.513 |
| 1.006100000000022 | -4.488 | -3.512 | -10.537 |
| 1.010050000000022 | -4.48 | -3.52 | -10.56 |
| 1.014000000000022 | -4.472 | -3.528 | -10.584 |
| 1.017950000000022 | -4.464 | -3.536 | -10.608 |
| 1.021900000000022 | -4.457 | -3.544 | -10.632 |
| 1.025850000000022 | -4.449 | -3.552 | -10.656 |
| 1.029800000000022 | -4.441 | -3.56 | -10.68 |
| 1.033750000000021 | -4.434 | -3.569 | -10.704 |
| 1.037700000000021 | -4.426 | -3.577 | -10.728 |
| 1.041650000000021 | -4.418 | -3.585 | -10.752 |
| 1.045600000000021 | -4.411 | -3.593 | -10.776 |
| 1.049550000000021 | -4.403 | -3.602 | -10.8 |
| 1.053500000000021 | -4.396 | -3.61 | -10.824 |
| 1.057450000000021 | -4.388 | -3.618 | -10.848 |
| 1.061400000000021 | -4.381 | -3.627 | -10.872 |
| 1.065350000000021 | -4.374 | -3.635 | -10.896 |
| 1.069300000000021 | -4.366 | -3.643 | -10.921 |
| 1.07325000000002 | -4.359 | -3.652 | -10.945 |
| 1.07720000000002 | -4.352 | -3.66 | -10.969 |
| 1.08115000000002 | -4.344 | -3.669 | -10.993 |
| 1.08510000000002 | -4.337 | -3.677 | -11.018 |
| 1.08905000000002 | -4.33 | -3.686 | -11.042 |
| 1.09300000000002 | -4.323 | -3.695 | -11.067 |
| 1.09695000000002 | -4.315 | -3.703 | -11.091 |
| 1.10090000000002 | -4.308 | -3.712 | -11.116 |
| 1.10485000000002 | -4.301 | -3.721 | -11.14 |
| 1.10880000000002 | -4.294 | -3.729 | -11.165 |
| 1.112750000000019 | -4.287 | -3.738 | -11.189 |
| 1.116700000000019 | -4.28 | -3.747 | -11.214 |
| 1.12065000000002 | -4.273 | -3.756 | -11.238 |
| 1.12460000000002 | -4.266 | -3.765 | -11.263 |
| 1.12855000000002 | -4.259 | -3.774 | -11.288 |
| 1.132500000000019 | -4.253 | -3.783 | -11.313 |
| 1.136450000000019 | -4.246 | -3.792 | -11.337 |
| 1.140400000000019 | -4.239 | -3.801 | -11.362 |
| 1.144350000000019 | -4.232 | -3.81 | -11.387 |
| 1.148300000000019 | -4.225 | -3.819 | -11.412 |
| 1.152250000000018 | -4.219 | -3.828 | -11.437 |
| 1.156200000000018 | -4.212 | -3.837 | -11.462 |
| 1.160150000000018 | -4.205 | -3.846 | -11.487 |
| 1.164100000000018 | -4.199 | -3.855 | -11.512 |
| 1.168050000000018 | -4.192 | -3.864 | -11.537 |
| 1.172000000000018 | -4.186 | -3.874 | -11.562 |
| 1.175950000000018 | -4.179 | -3.883 | -11.587 |
| 1.179900000000018 | -4.173 | -3.892 | -11.612 |
| 1.183850000000018 | -4.166 | -3.902 | -11.637 |
| 1.187800000000017 | -4.16 | -3.911 | -11.662 |
| 1.191750000000017 | -4.153 | -3.92 | -11.687 |
| 1.195700000000017 | -4.147 | -3.93 | -11.712 |
| 1.199650000000017 | -4.141 | -3.939 | -11.738 |
| 1.203600000000017 | -4.134 | -3.949 | -11.763 |
| 1.207550000000017 | -4.128 | -3.958 | -11.788 |
| 1.211500000000017 | -4.122 | -3.968 | -11.814 |
| 1.215450000000017 | -4.116 | -3.977 | -11.839 |
| 1.219400000000017 | -4.109 | -3.987 | -11.865 |
| 1.223350000000017 | -4.103 | -3.997 | -11.89 |
| 1.227300000000016 | -4.097 | -4.006 | -11.915 |
| 1.231250000000016 | -4.091 | -4.016 | -11.941 |
| 1.235200000000016 | -4.085 | -4.026 | -11.967 |
| 1.239150000000016 | -4.079 | -4.035 | -11.992 |
| 1.243100000000016 | -4.073 | -4.045 | -12.018 |
| 1.247050000000016 | -4.067 | -4.055 | -12.043 |
| 1.251000000000016 | -4.061 | -4.065 | -12.069 |
| 1.254950000000016 | -4.055 | -4.075 | -12.095 |
| 1.258900000000016 | -4.049 | -4.085 | -12.12 |
| 1.262850000000016 | -4.043 | -4.095 | -12.146 |
| 1.266800000000015 | -4.038 | -4.105 | -12.172 |
| 1.270750000000015 | -4.032 | -4.115 | -12.198 |
| 1.274700000000015 | -4.026 | -4.125 | -12.224 |
| 1.278650000000015 | -4.02 | -4.135 | -12.25 |
| 1.282600000000015 | -4.015 | -4.145 | -12.275 |
| 1.286550000000015 | -4.009 | -4.155 | -12.301 |
| 1.290500000000015 | -4.003 | -4.165 | -12.327 |
| 1.294450000000015 | -3.998 | -4.176 | -12.353 |
| 1.298400000000015 | -3.992 | -4.186 | -12.379 |
| 1.302350000000015 | -3.987 | -4.196 | -12.406 |
| 1.306300000000014 | -3.981 | -4.206 | -12.432 |
| 1.310250000000014 | -3.976 | -4.217 | -12.458 |
| 1.314200000000014 | -3.97 | -4.227 | -12.484 |
| 1.318150000000014 | -3.965 | -4.238 | -12.51 |
| 1.322100000000014 | -3.96 | -4.248 | -12.536 |
| 1.326050000000014 | -3.954 | -4.258 | -12.563 |
| 1.330000000000014 | -3.949 | -4.269 | -12.589 |
| 1.333950000000014 | -3.944 | -4.279 | -12.615 |
| 1.337900000000014 | -3.938 | -4.29 | -12.642 |
| 1.341850000000013 | -3.933 | -4.301 | -12.668 |
| 1.345800000000013 | -3.928 | -4.311 | -12.694 |
| 1.349750000000013 | -3.923 | -4.322 | -12.721 |
| 1.353700000000013 | -3.918 | -4.333 | -12.747 |
| 1.357650000000013 | -3.913 | -4.343 | -12.774 |
| 1.361600000000013 | -3.908 | -4.354 | -12.8 |
| 1.365550000000013 | -3.903 | -4.365 | -12.827 |
| 1.369500000000013 | -3.898 | -4.376 | -12.854 |
| 1.373450000000013 | -3.893 | -4.386 | -12.88 |
| 1.377400000000013 | -3.888 | -4.397 | -12.907 |
| 1.381350000000012 | -3.883 | -4.408 | -12.934 |
| 1.385300000000012 | -3.878 | -4.419 | -12.96 |
| 1.389250000000012 | -3.873 | -4.43 | -12.987 |
| 1.393200000000012 | -3.868 | -4.441 | -13.014 |
| 1.397150000000012 | -3.863 | -4.452 | -13.041 |
| 1.401100000000012 | -3.859 | -4.463 | -13.067 |
| 1.405050000000012 | -3.854 | -4.474 | -13.094 |
| 1.409000000000012 | -3.849 | -4.485 | -13.121 |
| 1.412950000000012 | -3.845 | -4.496 | -13.148 |
| 1.416900000000012 | -3.84 | -4.508 | -13.175 |
| 1.420850000000011 | -3.835 | -4.519 | -13.202 |
| 1.424800000000011 | -3.831 | -4.53 | -13.229 |
| 1.428750000000011 | -3.826 | -4.541 | -13.256 |
| 1.432700000000011 | -3.822 | -4.553 | -13.283 |
| 1.436650000000011 | -3.817 | -4.564 | -13.311 |
| 1.440600000000011 | -3.813 | -4.575 | -13.338 |
| 1.444550000000011 | -3.809 | -4.587 | -13.365 |
| 1.448500000000011 | -3.804 | -4.598 | -13.392 |
| 1.452450000000011 | -3.8 | -4.61 | -13.419 |
| 1.456400000000011 | -3.796 | -4.621 | -13.447 |
| 1.46035000000001 | -3.791 | -4.633 | -13.474 |
| 1.46430000000001 | -3.787 | -4.644 | -13.501 |
| 1.46825000000001 | -3.783 | -4.656 | -13.529 |
| 1.47220000000001 | -3.779 | -4.667 | -13.556 |
| 1.47615000000001 | -3.774 | -4.679 | -13.584 |
| 1.48010000000001 | -3.77 | -4.691 | -13.611 |
| 1.48405000000001 | -3.766 | -4.702 | -13.639 |
| 1.48800000000001 | -3.762 | -4.714 | -13.666 |
| 1.49195000000001 | -3.758 | -4.726 | -13.694 |
| 1.49590000000001 | -3.754 | -4.738 | -13.721 |
| 1.499850000000009 | -3.75 | -4.75 | -13.749 |
| 1.503800000000009 | -3.746 | -4.761 | -13.777 |
| 1.507750000000009 | -3.742 | -4.773 | -13.804 |
| 1.511700000000009 | -3.738 | -4.785 | -13.832 |
| 1.51565000000001 | -3.735 | -4.797 | -13.86 |
| 1.519600000000009 | -3.731 | -4.809 | -13.888 |
| 1.523550000000009 | -3.727 | -4.821 | -13.915 |
| 1.527500000000009 | -3.723 | -4.833 | -13.943 |
| 1.531450000000009 | -3.72 | -4.845 | -13.971 |
| 1.535400000000009 | -3.716 | -4.857 | -13.999 |
| 1.539350000000008 | -3.712 | -4.87 | -14.027 |
| 1.543300000000008 | -3.709 | -4.882 | -14.055 |
| 1.547250000000008 | -3.705 | -4.894 | -14.083 |
| 1.551200000000008 | -3.701 | -4.906 | -14.111 |
| 1.555150000000008 | -3.698 | -4.918 | -14.139 |
| 1.559100000000008 | -3.694 | -4.931 | -14.167 |
| 1.563050000000008 | -3.691 | -4.943 | -14.195 |
| 1.567000000000008 | -3.687 | -4.955 | -14.223 |
| 1.570950000000008 | -3.684 | -4.968 | -14.252 |
| 1.574900000000008 | -3.681 | -4.98 | -14.28 |
| 1.578850000000007 | -3.677 | -4.993 | -14.308 |
| 1.582800000000007 | -3.674 | -5.005 | -14.336 |
| 1.586750000000007 | -3.671 | -5.018 | -14.365 |
| 1.590700000000007 | -3.668 | -5.03 | -14.393 |
| 1.594650000000007 | -3.664 | -5.043 | -14.422 |
| 1.598600000000007 | -3.661 | -5.056 | -14.45 |
| 1.602550000000007 | -3.658 | -5.068 | -14.478 |
| 1.606500000000007 | -3.655 | -5.081 | -14.507 |
| 1.610450000000007 | -3.652 | -5.094 | -14.535 |
| 1.614400000000006 | -3.649 | -5.106 | -14.564 |
| 1.618350000000006 | -3.646 | -5.119 | -14.592 |
| 1.622300000000006 | -3.643 | -5.132 | -14.621 |
| 1.626250000000006 | -3.64 | -5.145 | -14.65 |
| 1.630200000000006 | -3.637 | -5.158 | -14.678 |
| 1.634150000000006 | -3.634 | -5.17 | -14.707 |
| 1.638100000000006 | -3.631 | -5.183 | -14.736 |
| 1.642050000000006 | -3.628 | -5.196 | -14.765 |
| 1.646000000000006 | -3.625 | -5.209 | -14.793 |
| 1.649950000000005 | -3.623 | -5.222 | -14.822 |
| 1.653900000000005 | -3.62 | -5.235 | -14.851 |
| 1.657850000000005 | -3.617 | -5.248 | -14.88 |
| 1.661800000000005 | -3.614 | -5.262 | -14.909 |
| 1.665750000000005 | -3.612 | -5.275 | -14.938 |
| 1.669700000000005 | -3.609 | -5.288 | -14.967 |
| 1.673650000000005 | -3.607 | -5.301 | -14.996 |
| 1.677600000000005 | -3.604 | -5.314 | -15.025 |
| 1.681550000000005 | -3.601 | -5.328 | -15.054 |
| 1.685500000000005 | -3.599 | -5.341 | -15.083 |
| 1.689450000000004 | -3.596 | -5.354 | -15.112 |
| 1.693400000000004 | -3.594 | -5.368 | -15.141 |
| 1.697350000000004 | -3.592 | -5.381 | -15.17 |
| 1.701300000000004 | -3.589 | -5.394 | -15.2 |
| 1.705250000000004 | -3.587 | -5.408 | -15.229 |
| 1.709200000000004 | -3.585 | -5.421 | -15.258 |
| 1.713150000000004 | -3.582 | -5.435 | -15.287 |
| 1.717100000000004 | -3.58 | -5.448 | -15.317 |
| 1.721050000000004 | -3.578 | -5.462 | -15.346 |
| 1.725000000000004 | -3.576 | -5.476 | -15.376 |
| 1.728950000000003 | -3.573 | -5.489 | -15.405 |
| 1.732900000000003 | -3.571 | -5.503 | -15.435 |
| 1.736850000000003 | -3.569 | -5.517 | -15.464 |
| 1.740800000000003 | -3.567 | -5.53 | -15.494 |
| 1.744750000000003 | -3.565 | -5.544 | -15.523 |
| 1.748700000000003 | -3.563 | -5.558 | -15.553 |
| 1.752650000000003 | -3.561 | -5.572 | -15.582 |
| 1.756600000000003 | -3.559 | -5.586 | -15.612 |
| 1.760550000000003 | -3.557 | -5.6 | -15.642 |
| 1.764500000000003 | -3.555 | -5.613 | -15.671 |
| 1.768450000000002 | -3.554 | -5.627 | -15.701 |
| 1.772400000000002 | -3.552 | -5.641 | -15.731 |
| 1.776350000000002 | -3.55 | -5.655 | -15.761 |
| 1.780300000000002 | -3.548 | -5.669 | -15.791 |
| 1.784250000000002 | -3.547 | -5.684 | -15.821 |
| 1.788200000000002 | -3.545 | -5.698 | -15.85 |
| 1.792150000000002 | -3.543 | -5.712 | -15.88 |
| 1.796100000000002 | -3.542 | -5.726 | -15.91 |
| 1.800050000000002 | -3.54 | -5.74 | -15.94 |
| 1.804000000000002 | -3.538 | -5.754 | -15.97 |
| 1.807950000000001 | -3.537 | -5.769 | -16 |
| 1.811900000000001 | -3.535 | -5.783 | -16.031 |
| 1.815850000000001 | -3.534 | -5.797 | -16.061 |
| 1.819800000000001 | -3.532 | -5.812 | -16.091 |
| 1.823750000000001 | -3.531 | -5.826 | -16.121 |
| 1.827700000000001 | -3.53 | -5.84 | -16.151 |
| 1.831650000000001 | -3.528 | -5.855 | -16.182 |
| 1.835600000000001 | -3.527 | -5.869 | -16.212 |
| 1.839550000000001 | -3.526 | -5.884 | -16.242 |
| 1.843500000000001 | -3.524 | -5.898 | -16.272 |
| 1.84745 | -3.523 | -5.913 | -16.303 |
| 1.8514 | -3.522 | -5.928 | -16.333 |
| 1.85535 | -3.521 | -5.942 | -16.364 |
| 1.8593 | -3.52 | -5.957 | -16.394 |
| 1.86325 | -3.519 | -5.972 | -16.425 |
| 1.8672 | -3.518 | -5.986 | -16.455 |
| 1.87115 | -3.517 | -6.001 | -16.486 |
| 1.8751 | -3.516 | -6.016 | -16.516 |
| 1.87905 | -3.515 | -6.031 | -16.547 |
| 1.883 | -3.514 | -6.046 | -16.578 |
| 1.886949999999999 | -3.513 | -6.061 | -16.608 |
| 1.890899999999999 | -3.512 | -6.076 | -16.639 |
| 1.894849999999999 | -3.511 | -6.09 | -16.67 |
| 1.898799999999999 | -3.51 | -6.105 | -16.701 |
| 1.902749999999999 | -3.509 | -6.12 | -16.731 |
| 1.906699999999999 | -3.509 | -6.136 | -16.762 |
| 1.910649999999999 | -3.508 | -6.151 | -16.793 |
| 1.914599999999999 | -3.507 | -6.166 | -16.824 |
| 1.918549999999999 | -3.507 | -6.181 | -16.855 |
| 1.922499999999999 | -3.506 | -6.196 | -16.886 |
| 1.926449999999998 | -3.505 | -6.211 | -16.917 |
| 1.930399999999998 | -3.505 | -6.226 | -16.948 |
| 1.934349999999998 | -3.504 | -6.242 | -16.979 |
| 1.938299999999998 | -3.504 | -6.257 | -17.01 |
| 1.942249999999998 | -3.503 | -6.272 | -17.041 |
| 1.946199999999998 | -3.503 | -6.288 | -17.072 |
| 1.950149999999998 | -3.502 | -6.303 | -17.104 |
| 1.954099999999998 | -3.502 | -6.319 | -17.135 |
| 1.958049999999998 | -3.502 | -6.334 | -17.166 |
| 1.961999999999997 | -3.501 | -6.349 | -17.197 |
| 1.965949999999997 | -3.501 | -6.365 | -17.229 |
| 1.969899999999997 | -3.501 | -6.381 | -17.26 |
| 1.973849999999997 | -3.501 | -6.396 | -17.291 |
| 1.977799999999997 | -3.5 | -6.412 | -17.323 |
| 1.981749999999997 | -3.5 | -6.427 | -17.354 |
| 1.985699999999997 | -3.5 | -6.443 | -17.386 |
| 1.989649999999997 | -3.5 | -6.459 | -17.417 |
| 1.993599999999997 | -3.5 | -6.474 | -17.449 |
| 1.997549999999997 | -3.5 | -6.49 | -17.48 |
| 2.001499999999997 | -3.5 | -6.506 | -17.512 |
| 2.005449999999997 | -3.5 | -6.522 | -17.544 |
| 2.009399999999997 | -3.5 | -6.538 | -17.575 |
| 2.013349999999997 | -3.5 | -6.554 | -17.607 |
| 2.017299999999997 | -3.5 | -6.569 | -17.639 |
| 2.021249999999997 | -3.5 | -6.585 | -17.67 |
| 2.025199999999997 | -3.501 | -6.601 | -17.702 |
| 2.029149999999997 | -3.501 | -6.617 | -17.734 |
| 2.033099999999997 | -3.501 | -6.633 | -17.766 |
| 2.037049999999998 | -3.501 | -6.65 | -17.798 |
| 2.040999999999998 | -3.502 | -6.666 | -17.83 |
| 2.044949999999998 | -3.502 | -6.682 | -17.862 |
| 2.048899999999998 | -3.502 | -6.698 | -17.894 |
| 2.052849999999998 | -3.503 | -6.714 | -17.926 |
| 2.056799999999998 | -3.503 | -6.73 | -17.958 |
| 2.060749999999998 | -3.504 | -6.747 | -17.99 |
| 2.064699999999998 | -3.504 | -6.763 | -18.022 |
| 2.068649999999999 | -3.505 | -6.779 | -18.054 |
| 2.072599999999999 | -3.505 | -6.796 | -18.086 |
| 2.076549999999999 | -3.506 | -6.812 | -18.118 |
| 2.080499999999999 | -3.506 | -6.828 | -18.15 |
| 2.084449999999999 | -3.507 | -6.845 | -18.183 |
| 2.0884 | -3.508 | -6.861 | -18.215 |
| 2.092349999999999 | -3.509 | -6.878 | -18.247 |
| 2.096299999999999 | -3.509 | -6.894 | -18.28 |
| 2.10025 | -3.51 | -6.911 | -18.312 |
| 2.1042 | -3.511 | -6.928 | -18.344 |
| 2.10815 | -3.512 | -6.944 | -18.377 |
| 2.1121 | -3.513 | -6.961 | -18.409 |
| 2.11605 | -3.513 | -6.978 | -18.442 |
| 2.12 | -3.514 | -6.994 | -18.474 |
| 2.12395 | -3.515 | -7.011 | -18.507 |
| 2.1279 | -3.516 | -7.028 | -18.54 |
| 2.13185 | -3.517 | -7.045 | -18.572 |
| 2.135800000000001 | -3.518 | -7.062 | -18.605 |
| 2.139750000000001 | -3.52 | -7.079 | -18.638 |
| 2.143700000000001 | -3.521 | -7.095 | -18.67 |
| 2.147650000000001 | -3.522 | -7.112 | -18.703 |
| 2.151600000000001 | -3.523 | -7.129 | -18.736 |
| 2.155550000000001 | -3.524 | -7.146 | -18.769 |
| 2.159500000000001 | -3.525 | -7.163 | -18.801 |
| 2.163450000000001 | -3.527 | -7.181 | -18.834 |
| 2.167400000000002 | -3.528 | -7.198 | -18.867 |
| 2.171350000000002 | -3.529 | -7.215 | -18.9 |
| 2.175300000000002 | -3.531 | -7.232 | -18.933 |
| 2.179250000000002 | -3.532 | -7.249 | -18.966 |
| 2.183200000000002 | -3.534 | -7.266 | -18.999 |
| 2.187150000000002 | -3.535 | -7.284 | -19.032 |
| 2.191100000000002 | -3.537 | -7.301 | -19.065 |
| 2.195050000000002 | -3.538 | -7.318 | -19.098 |
| 2.199000000000002 | -3.54 | -7.336 | -19.132 |
| 2.202950000000003 | -3.541 | -7.353 | -19.165 |
| 2.206900000000003 | -3.543 | -7.37 | -19.198 |
| 2.210850000000003 | -3.544 | -7.388 | -19.231 |
| 2.214800000000003 | -3.546 | -7.405 | -19.265 |
| 2.218750000000003 | -3.548 | -7.423 | -19.298 |
| 2.222700000000003 | -3.55 | -7.44 | -19.331 |
| 2.226650000000003 | -3.551 | -7.458 | -19.365 |
| 2.230600000000003 | -3.553 | -7.476 | -19.398 |
| 2.234550000000004 | -3.555 | -7.493 | -19.431 |
| 2.238500000000004 | -3.557 | -7.511 | -19.465 |
| 2.242450000000004 | -3.559 | -7.529 | -19.498 |
| 2.246400000000004 | -3.561 | -7.546 | -19.532 |
| 2.250350000000004 | -3.563 | -7.564 | -19.565 |
| 2.254300000000004 | -3.565 | -7.582 | -19.599 |
| 2.258250000000004 | -3.567 | -7.6 | -19.633 |
| 2.262200000000004 | -3.569 | -7.618 | -19.666 |
| 2.266150000000005 | -3.571 | -7.635 | -19.7 |
| 2.270100000000005 | -3.573 | -7.653 | -19.734 |
| 2.274050000000005 | -3.575 | -7.671 | -19.768 |
| 2.278000000000005 | -3.577 | -7.689 | -19.801 |
| 2.281950000000005 | -3.579 | -7.707 | -19.835 |
| 2.285900000000005 | -3.582 | -7.725 | -19.869 |
| 2.289850000000005 | -3.584 | -7.743 | -19.903 |
| 2.293800000000005 | -3.586 | -7.762 | -19.937 |
| 2.297750000000005 | -3.589 | -7.78 | -19.971 |
| 2.301700000000006 | -3.591 | -7.798 | -20.005 |
| 2.305650000000006 | -3.593 | -7.816 | -20.039 |
| 2.309600000000006 | -3.596 | -7.834 | -20.073 |
| 2.313550000000006 | -3.598 | -7.853 | -20.107 |
| 2.317500000000006 | -3.601 | -7.871 | -20.141 |
| 2.321450000000006 | -3.603 | -7.889 | -20.175 |
| 2.325400000000006 | -3.606 | -7.907 | -20.209 |
| 2.329350000000006 | -3.608 | -7.926 | -20.243 |
| 2.333300000000007 | -3.611 | -7.944 | -20.277 |
| 2.337250000000007 | -3.614 | -7.963 | -20.312 |
| 2.341200000000007 | -3.616 | -7.981 | -20.346 |
| 2.345150000000007 | -3.619 | -8 | -20.38 |
| 2.349100000000007 | -3.622 | -8.018 | -20.415 |
| 2.353050000000007 | -3.625 | -8.037 | -20.449 |
| 2.357000000000007 | -3.627 | -8.055 | -20.483 |
| 2.360950000000007 | -3.63 | -8.074 | -20.518 |
| 2.364900000000007 | -3.633 | -8.093 | -20.552 |
| 2.368850000000008 | -3.636 | -8.111 | -20.587 |
| 2.372800000000008 | -3.639 | -8.13 | -20.621 |
| 2.376750000000008 | -3.642 | -8.149 | -20.656 |
| 2.380700000000008 | -3.645 | -8.168 | -20.691 |
| 2.384650000000008 | -3.648 | -8.187 | -20.725 |
| 2.388600000000008 | -3.651 | -8.205 | -20.76 |
| 2.392550000000008 | -3.654 | -8.224 | -20.794 |
| 2.396500000000008 | -3.657 | -8.243 | -20.829 |
| 2.400450000000009 | -3.66 | -8.262 | -20.864 |
| 2.404400000000009 | -3.664 | -8.281 | -20.899 |
| 2.408350000000009 | -3.667 | -8.3 | -20.934 |
| 2.412300000000009 | -3.67 | -8.319 | -20.968 |
| 2.416250000000009 | -3.673 | -8.338 | -21.003 |
| 2.420200000000009 | -3.677 | -8.357 | -21.038 |
| 2.424150000000009 | -3.68 | -8.377 | -21.073 |
| 2.428100000000009 | -3.683 | -8.396 | -21.108 |
| 2.43205000000001 | -3.687 | -8.415 | -21.143 |
| 2.43600000000001 | -3.69 | -8.434 | -21.178 |
| 2.43995000000001 | -3.694 | -8.453 | -21.213 |
| 2.44390000000001 | -3.697 | -8.473 | -21.248 |
| 2.44785000000001 | -3.701 | -8.492 | -21.283 |
| 2.45180000000001 | -3.704 | -8.511 | -21.319 |
| 2.45575000000001 | -3.708 | -8.531 | -21.354 |
| 2.45970000000001 | -3.711 | -8.55 | -21.389 |
| 2.463650000000011 | -3.715 | -8.57 | -21.424 |
| 2.467600000000011 | -3.719 | -8.589 | -21.459 |
| 2.471550000000011 | -3.722 | -8.609 | -21.495 |
| 2.475500000000011 | -3.726 | -8.628 | -21.53 |
| 2.479450000000011 | -3.73 | -8.648 | -21.565 |
| 2.483400000000011 | -3.734 | -8.667 | -21.601 |
| 2.487350000000011 | -3.738 | -8.687 | -21.636 |
| 2.491300000000011 | -3.741 | -8.707 | -21.672 |
| 2.495250000000011 | -3.745 | -8.726 | -21.707 |
| 2.499200000000012 | -3.749 | -8.746 | -21.743 |
| 2.503150000000012 | -3.753 | -8.766 | -21.778 |
| 2.507100000000012 | -3.757 | -8.786 | -21.814 |
| 2.511050000000012 | -3.761 | -8.805 | -21.85 |
| 2.515000000000012 | -3.765 | -8.825 | -21.885 |
| 2.518950000000012 | -3.769 | -8.845 | -21.921 |
| 2.522900000000012 | -3.773 | -8.865 | -21.957 |
| 2.526850000000012 | -3.778 | -8.885 | -21.992 |
| 2.530800000000013 | -3.782 | -8.905 | -22.028 |
| 2.534750000000013 | -3.786 | -8.925 | -22.064 |
| 2.538700000000013 | -3.79 | -8.945 | -22.1 |
| 2.542650000000013 | -3.794 | -8.965 | -22.136 |
| 2.546600000000013 | -3.799 | -8.985 | -22.172 |
| 2.550550000000013 | -3.803 | -9.005 | -22.208 |
| 2.554500000000013 | -3.807 | -9.025 | -22.243 |
| 2.558450000000013 | -3.812 | -9.046 | -22.279 |
| 2.562400000000014 | -3.816 | -9.066 | -22.315 |
| 2.566350000000014 | -3.821 | -9.086 | -22.352 |
| 2.570300000000014 | -3.825 | -9.106 | -22.388 |
| 2.574250000000014 | -3.83 | -9.127 | -22.424 |
| 2.578200000000014 | -3.834 | -9.147 | -22.46 |
| 2.582150000000014 | -3.839 | -9.167 | -22.496 |
| 2.586100000000014 | -3.844 | -9.188 | -22.532 |
| 2.590050000000014 | -3.848 | -9.208 | -22.569 |
| 2.594000000000014 | -3.853 | -9.229 | -22.605 |
| 2.597950000000015 | -3.858 | -9.249 | -22.641 |
| 2.601900000000015 | -3.862 | -9.27 | -22.677 |
| 2.605850000000015 | -3.867 | -9.29 | -22.714 |
| 2.609800000000015 | -3.872 | -9.311 | -22.75 |
| 2.613750000000015 | -3.877 | -9.332 | -22.787 |
| 2.617700000000015 | -3.882 | -9.352 | -22.823 |
| 2.621650000000015 | -3.886 | -9.373 | -22.86 |
| 2.625600000000015 | -3.891 | -9.394 | -22.896 |
| 2.629550000000016 | -3.896 | -9.415 | -22.933 |
| 2.633500000000016 | -3.901 | -9.435 | -22.969 |
| 2.637450000000016 | -3.906 | -9.456 | -23.006 |
| 2.641400000000016 | -3.911 | -9.477 | -23.043 |
| 2.645350000000016 | -3.916 | -9.498 | -23.079 |
| 2.649300000000016 | -3.922 | -9.519 | -23.116 |
| 2.653250000000016 | -3.927 | -9.54 | -23.153 |
| 2.657200000000016 | -3.932 | -9.561 | -23.19 |
| 2.661150000000016 | -3.937 | -9.582 | -23.226 |
| 2.665100000000016 | -3.942 | -9.603 | -23.263 |
| 2.669050000000017 | -3.948 | -9.624 | -23.3 |
| 2.673000000000017 | -3.953 | -9.645 | -23.337 |
| 2.676950000000017 | -3.958 | -9.666 | -23.374 |
| 2.680900000000017 | -3.964 | -9.687 | -23.411 |
| 2.684850000000017 | -3.969 | -9.708 | -23.448 |
| 2.688800000000017 | -3.974 | -9.73 | -23.485 |
| 2.692750000000017 | -3.98 | -9.751 | -23.522 |
| 2.696700000000018 | -3.985 | -9.772 | -23.559 |
| 2.700650000000018 | -3.991 | -9.794 | -23.596 |
| 2.704600000000018 | -3.996 | -9.815 | -23.633 |
| 2.708550000000018 | -4.002 | -9.836 | -23.67 |
| 2.712500000000018 | -4.008 | -9.858 | -23.708 |
| 2.716450000000018 | -4.013 | -9.879 | -23.745 |
| 2.720400000000018 | -4.019 | -9.901 | -23.782 |
| 2.724350000000018 | -4.025 | -9.922 | -23.819 |
| 2.728300000000018 | -4.03 | -9.944 | -23.857 |
| 2.732250000000019 | -4.036 | -9.965 | -23.894 |
| 2.736200000000019 | -4.042 | -9.987 | -23.932 |
| 2.740150000000019 | -4.048 | -10.008 | -23.969 |
| 2.74410000000002 | -4.054 | -10.03 | -24.006 |
| 2.74805000000002 | -4.06 | -10.052 | -24.044 |
| 2.752000000000019 | -4.066 | -10.074 | -24.082 |
| 2.755950000000019 | -4.071 | -10.095 | -24.119 |
| 2.759900000000019 | -4.077 | -10.117 | -24.157 |
| 2.76385000000002 | -4.083 | -10.139 | -24.194 |
| 2.76780000000002 | -4.09 | -10.161 | -24.232 |
| 2.77175000000002 | -4.096 | -10.183 | -24.27 |
| 2.77570000000002 | -4.102 | -10.205 | -24.307 |
| 2.77965000000002 | -4.108 | -10.226 | -24.345 |
| 2.78360000000002 | -4.114 | -10.248 | -24.383 |
| 2.78755000000002 | -4.12 | -10.27 | -24.421 |
| 2.79150000000002 | -4.126 | -10.292 | -24.458 |
| 2.795450000000021 | -4.133 | -10.315 | -24.496 |
| 2.799400000000021 | -4.139 | -10.337 | -24.534 |
| 2.803350000000021 | -4.145 | -10.359 | -24.572 |
| 2.807300000000021 | -4.152 | -10.381 | -24.61 |
| 2.811250000000021 | -4.158 | -10.403 | -24.648 |
| 2.815200000000021 | -4.165 | -10.425 | -24.686 |
| 2.819150000000021 | -4.171 | -10.448 | -24.724 |
| 2.823100000000021 | -4.177 | -10.47 | -24.762 |
| 2.827050000000022 | -4.184 | -10.492 | -24.8 |
| 2.831000000000022 | -4.191 | -10.515 | -24.839 |
| 2.834950000000022 | -4.197 | -10.537 | -24.877 |
| 2.838900000000022 | -4.204 | -10.559 | -24.915 |
| 2.842850000000022 | -4.21 | -10.582 | -24.953 |
| 2.846800000000022 | -4.217 | -10.604 | -24.991 |
| 2.850750000000022 | -4.224 | -10.627 | -25.03 |
| 2.854700000000022 | -4.231 | -10.649 | -25.068 |
| 2.858650000000023 | -4.237 | -10.672 | -25.106 |
| 2.862600000000023 | -4.244 | -10.694 | -25.145 |
| 2.866550000000023 | -4.251 | -10.717 | -25.183 |
| 2.870500000000023 | -4.258 | -10.74 | -25.222 |
| 2.874450000000023 | -4.265 | -10.762 | -25.26 |
| 2.878400000000023 | -4.272 | -10.785 | -25.299 |
| 2.882350000000023 | -4.279 | -10.808 | -25.337 |
| 2.886300000000023 | -4.286 | -10.831 | -25.376 |
| 2.890250000000023 | -4.293 | -10.854 | -25.415 |
| 2.894200000000024 | -4.3 | -10.876 | -25.453 |
| 2.898150000000024 | -4.307 | -10.899 | -25.492 |
| 2.902100000000024 | -4.314 | -10.922 | -25.531 |
| 2.906050000000024 | -4.321 | -10.945 | -25.569 |
| 2.910000000000024 | -4.328 | -10.968 | -25.608 |
| 2.913950000000024 | -4.335 | -10.991 | -25.647 |
| 2.917900000000024 | -4.343 | -11.014 | -25.686 |
| 2.921850000000024 | -4.35 | -11.037 | -25.725 |
| 2.925800000000025 | -4.357 | -11.06 | -25.764 |
| 2.929750000000025 | -4.364 | -11.083 | -25.802 |
| 2.933700000000025 | -4.372 | -11.107 | -25.841 |
| 2.937650000000025 | -4.379 | -11.13 | -25.88 |
| 2.941600000000025 | -4.387 | -11.153 | -25.919 |
| 2.945550000000025 | -4.394 | -11.176 | -25.958 |
| 2.949500000000025 | -4.402 | -11.2 | -25.998 |
| 2.953450000000025 | -4.409 | -11.223 | -26.037 |
| 2.957400000000026 | -4.417 | -11.246 | -26.076 |
| 2.961350000000026 | -4.424 | -11.27 | -26.115 |
| 2.965300000000026 | -4.432 | -11.293 | -26.154 |
| 2.969250000000026 | -4.439 | -11.316 | -26.193 |
| 2.973200000000026 | -4.447 | -11.34 | -26.233 |
| 2.977150000000026 | -4.455 | -11.363 | -26.272 |
| 2.981100000000026 | -4.463 | -11.387 | -26.311 |
| 2.985050000000026 | -4.47 | -11.411 | -26.351 |
| 2.989000000000026 | -4.478 | -11.434 | -26.39 |
| 2.992950000000027 | -4.486 | -11.458 | -26.43 |
| 2.996900000000027 | -4.494 | -11.481 | -26.469 |
| 3.000850000000027 | -4.502 | -11.505 | -26.509 |
| 3.004800000000027 | -4.51 | -11.529 | -26.548 |
| 3.008750000000027 | -4.518 | -11.553 | -26.588 |
| 3.012700000000027 | -4.526 | -11.576 | -26.627 |
| 3.016650000000027 | -4.534 | -11.6 | -26.667 |
| 3.020600000000027 | -4.542 | -11.624 | -26.706 |
| 3.024550000000028 | -4.55 | -11.648 | -26.746 |
| 3.028500000000028 | -4.558 | -11.672 | -26.786 |
| 3.032450000000028 | -4.566 | -11.696 | -26.826 |
| 3.036400000000028 | -4.574 | -11.72 | -26.865 |
| 3.040350000000028 | -4.582 | -11.744 | -26.905 |
| 3.044300000000028 | -4.591 | -11.768 | -26.945 |
| 3.048250000000028 | -4.599 | -11.792 | -26.985 |
| 3.052200000000028 | -4.607 | -11.816 | -27.025 |
| 3.056150000000029 | -4.615 | -11.84 | -27.065 |
| 3.060100000000029 | -4.624 | -11.864 | -27.105 |
| 3.064050000000029 | -4.632 | -11.888 | -27.145 |
| 3.068000000000029 | -4.641 | -11.913 | -27.185 |
| 3.071950000000029 | -4.649 | -11.937 | -27.225 |
| 3.075900000000029 | -4.658 | -11.961 | -27.265 |
| 3.079850000000029 | -4.666 | -11.985 | -27.305 |
| 3.083800000000029 | -4.675 | -12.01 | -27.345 |
| 3.08775000000003 | -4.683 | -12.034 | -27.385 |
| 3.09170000000003 | -4.692 | -12.059 | -27.425 |
| 3.09565000000003 | -4.7 | -12.083 | -27.466 |
| 3.09960000000003 | -4.709 | -12.108 | -27.506 |
| 3.10355000000003 | -4.718 | -12.132 | -27.546 |
| 3.10750000000003 | -4.727 | -12.157 | -27.587 |
| 3.11145000000003 | -4.735 | -12.181 | -27.627 |
| 3.11540000000003 | -4.744 | -12.206 | -27.667 |
| 3.11935000000003 | -4.753 | -12.23 | -27.708 |
| 3.12330000000003 | -4.762 | -12.255 | -27.748 |
| 3.127250000000031 | -4.771 | -12.28 | -27.789 |
| 3.131200000000031 | -4.78 | -12.304 | -27.829 |
| 3.135150000000031 | -4.789 | -12.329 | -27.87 |
| 3.139100000000031 | -4.798 | -12.354 | -27.91 |
| 3.143050000000031 | -4.807 | -12.379 | -27.951 |
| 3.147000000000031 | -4.816 | -12.404 | -27.992 |
| 3.150950000000031 | -4.825 | -12.428 | -28.032 |
| 3.154900000000032 | -4.834 | -12.453 | -28.073 |
| 3.158850000000032 | -4.843 | -12.478 | -28.114 |
| 3.162800000000032 | -4.852 | -12.503 | -28.155 |
| 3.166750000000032 | -4.861 | -12.528 | -28.195 |
| 3.170700000000032 | -4.871 | -12.553 | -28.236 |
| 3.174650000000032 | -4.88 | -12.578 | -28.277 |
| 3.178600000000032 | -4.889 | -12.603 | -28.318 |
| 3.182550000000032 | -4.898 | -12.629 | -28.359 |
| 3.186500000000032 | -4.908 | -12.654 | -28.4 |
| 3.190450000000033 | -4.917 | -12.679 | -28.441 |
| 3.194400000000033 | -4.927 | -12.704 | -28.482 |
| 3.198350000000033 | -4.936 | -12.729 | -28.523 |
| 3.202300000000033 | -4.946 | -12.755 | -28.564 |
| 3.206250000000033 | -4.955 | -12.78 | -28.605 |
| 3.210200000000033 | -4.965 | -12.805 | -28.646 |
| 3.214150000000033 | -4.974 | -12.831 | -28.687 |
| 3.218100000000033 | -4.984 | -12.856 | -28.729 |
| 3.222050000000034 | -4.993 | -12.882 | -28.77 |
| 3.226000000000034 | -5.003 | -12.907 | -28.811 |
| 3.229950000000034 | -5.013 | -12.933 | -28.852 |
| 3.233900000000034 | -5.023 | -12.958 | -28.894 |
| 3.237850000000034 | -5.032 | -12.984 | -28.935 |
| 3.241800000000034 | -5.042 | -13.009 | -28.976 |
| 3.245750000000034 | -5.052 | -13.035 | -29.018 |
| 3.249700000000034 | -5.062 | -13.061 | -29.059 |
| 3.253650000000035 | -5.072 | -13.086 | -29.101 |
| 3.257600000000035 | -5.082 | -13.112 | -29.142 |
| 3.261550000000035 | -5.092 | -13.138 | -29.184 |
| 3.265500000000035 | -5.101 | -13.163 | -29.225 |
| 3.269450000000035 | -5.112 | -13.189 | -29.267 |
| 3.273400000000035 | -5.122 | -13.215 | -29.309 |
| 3.277350000000035 | -5.132 | -13.241 | -29.35 |
| 3.281300000000035 | -5.142 | -13.267 | -29.392 |
| 3.285250000000036 | -5.152 | -13.293 | -29.434 |
| 3.289200000000036 | -5.162 | -13.319 | -29.476 |
| 3.293150000000036 | -5.172 | -13.345 | -29.517 |
| 3.297100000000036 | -5.182 | -13.371 | -29.559 |
| 3.301050000000036 | -5.193 | -13.397 | -29.601 |
| 3.305000000000036 | -5.203 | -13.423 | -29.643 |
| 3.308950000000036 | -5.213 | -13.449 | -29.685 |
| 3.312900000000036 | -5.224 | -13.475 | -29.727 |
| 3.316850000000036 | -5.234 | -13.501 | -29.769 |
| 3.320800000000037 | -5.245 | -13.528 | -29.811 |
| 3.324750000000037 | -5.255 | -13.554 | -29.853 |
| 3.328700000000037 | -5.265 | -13.58 | -29.895 |
| 3.332650000000037 | -5.276 | -13.607 | -29.937 |
| 3.336600000000037 | -5.286 | -13.633 | -29.979 |
| 3.340550000000037 | -5.297 | -13.659 | -30.021 |
| 3.344500000000037 | -5.308 | -13.686 | -30.064 |
| 3.348450000000037 | -5.318 | -13.712 | -30.106 |
| 3.352400000000038 | -5.329 | -13.739 | -30.148 |
| 3.356350000000038 | -5.34 | -13.765 | -30.19 |
| 3.360300000000038 | -5.35 | -13.792 | -30.233 |
| 3.364250000000038 | -5.361 | -13.818 | -30.275 |
| 3.368200000000038 | -5.372 | -13.845 | -30.318 |
| 3.372150000000038 | -5.383 | -13.871 | -30.36 |
| 3.376100000000038 | -5.394 | -13.898 | -30.402 |
| 3.380050000000038 | -5.405 | -13.925 | -30.445 |
| 3.384000000000038 | -5.415 | -13.951 | -30.487 |
| 3.387950000000039 | -5.426 | -13.978 | -30.53 |
| 3.391900000000039 | -5.437 | -14.005 | -30.573 |
| 3.395850000000039 | -5.448 | -14.032 | -30.615 |
| 3.399800000000039 | -5.459 | -14.059 | -30.658 |
| 3.40375000000004 | -5.471 | -14.086 | -30.701 |
| 3.40770000000004 | -5.482 | -14.112 | -30.743 |
| 3.411650000000039 | -5.493 | -14.139 | -30.786 |
| 3.415600000000039 | -5.504 | -14.166 | -30.829 |
| 3.41955000000004 | -5.515 | -14.193 | -30.872 |
| 3.42350000000004 | -5.526 | -14.22 | -30.914 |
| 3.42745000000004 | -5.538 | -14.247 | -30.957 |
| 3.43140000000004 | -5.549 | -14.275 | -31 |
| 3.43535000000004 | -5.56 | -14.302 | -31.043 |
| 3.43930000000004 | -5.572 | -14.329 | -31.086 |
| 3.44325000000004 | -5.583 | -14.356 | -31.129 |
| 3.44720000000004 | -5.594 | -14.383 | -31.172 |
| 3.451150000000041 | -5.606 | -14.41 | -31.215 |
| 3.455100000000041 | -5.617 | -14.438 | -31.258 |
| 3.459050000000041 | -5.629 | -14.465 | -31.301 |
| 3.463000000000041 | -5.64 | -14.492 | -31.344 |
| 3.466950000000041 | -5.652 | -14.52 | -31.388 |
| 3.470900000000041 | -5.664 | -14.547 | -31.431 |
| 3.474850000000041 | -5.675 | -14.575 | -31.474 |
| 3.478800000000041 | -5.687 | -14.602 | -31.517 |
| 3.482750000000041 | -5.699 | -14.63 | -31.561 |
| 3.486700000000042 | -5.71 | -14.657 | -31.604 |
| 3.490650000000042 | -5.722 | -14.685 | -31.647 |
| 3.494600000000042 | -5.734 | -14.712 | -31.691 |
| 3.498550000000042 | -5.746 | -14.74 | -31.734 |
| 3.502500000000042 | -5.758 | -14.768 | -31.778 |
| 3.506450000000042 | -5.769 | -14.795 | -31.821 |
| 3.510400000000042 | -5.781 | -14.823 | -31.865 |
| 3.514350000000042 | -5.793 | -14.851 | -31.908 |
| 3.518300000000043 | -5.805 | -14.878 | -31.952 |
| 3.522250000000043 | -5.817 | -14.906 | -31.995 |
| 3.526200000000043 | -5.829 | -14.934 | -32.039 |
| 3.530150000000043 | -5.841 | -14.962 | -32.083 |
| 3.534100000000043 | -5.853 | -14.99 | -32.126 |
| 3.538050000000043 | -5.866 | -15.018 | -32.17 |
| 3.542000000000043 | -5.878 | -15.046 | -32.214 |
| 3.545950000000043 | -5.89 | -15.074 | -32.258 |
| 3.549900000000044 | -5.902 | -15.102 | -32.301 |
| 3.553850000000044 | -5.914 | -15.13 | -32.345 |
| 3.557800000000044 | -5.927 | -15.158 | -32.389 |
| 3.561750000000044 | -5.939 | -15.186 | -32.433 |
| 3.565700000000044 | -5.951 | -15.214 | -32.477 |
| 3.569650000000044 | -5.964 | -15.242 | -32.521 |
| 3.573600000000044 | -5.976 | -15.271 | -32.565 |
| 3.577550000000044 | -5.989 | -15.299 | -32.609 |
| 3.581500000000045 | -6.001 | -15.327 | -32.653 |
| 3.585450000000045 | -6.014 | -15.355 | -32.697 |
| 3.589400000000045 | -6.026 | -15.384 | -32.741 |
| 3.593350000000045 | -6.039 | -15.412 | -32.786 |
| 3.597300000000045 | -6.051 | -15.441 | -32.83 |
| 3.601250000000045 | -6.064 | -15.469 | -32.874 |
| 3.605200000000045 | -6.077 | -15.497 | -32.918 |
| 3.609150000000045 | -6.089 | -15.526 | -32.963 |
| 3.613100000000045 | -6.102 | -15.554 | -33.007 |
| 3.617050000000046 | -6.115 | -15.583 | -33.051 |
| 3.621000000000046 | -6.128 | -15.612 | -33.096 |
| 3.624950000000046 | -6.14 | -15.64 | -33.14 |
| 3.628900000000046 | -6.153 | -15.669 | -33.185 |
| 3.632850000000046 | -6.166 | -15.698 | -33.229 |
| 3.636800000000046 | -6.179 | -15.726 | -33.274 |
| 3.640750000000046 | -6.192 | -15.755 | -33.318 |
| 3.644700000000046 | -6.205 | -15.784 | -33.363 |
| 3.648650000000046 | -6.218 | -15.813 | -33.407 |
| 3.652600000000047 | -6.231 | -15.841 | -33.452 |
| 3.656550000000047 | -6.244 | -15.87 | -33.497 |
| 3.660500000000047 | -6.257 | -15.899 | -33.541 |
| 3.664450000000047 | -6.27 | -15.928 | -33.586 |
| 3.668400000000047 | -6.284 | -15.957 | -33.631 |
| 3.672350000000047 | -6.297 | -15.986 | -33.676 |
| 3.676300000000047 | -6.31 | -16.015 | -33.72 |
| 3.680250000000047 | -6.323 | -16.044 | -33.765 |
| 3.684200000000048 | -6.337 | -16.073 | -33.81 |
| 3.688150000000048 | -6.35 | -16.102 | -33.855 |
| 3.692100000000048 | -6.363 | -16.132 | -33.9 |
| 3.696050000000048 | -6.377 | -16.161 | -33.945 |
| 3.700000000000048 | -6.39 | -16.19 | -33.99 |